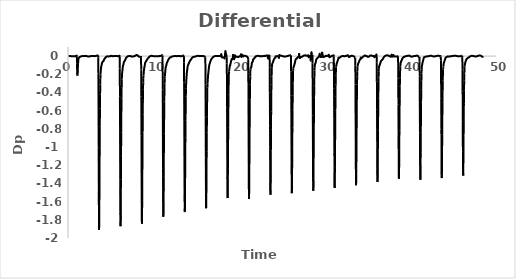
| Category | DP_Y |
|---|---|
| 0.083333 | 0.001 |
| 0.1 | 0.001 |
| 0.116667 | 0.001 |
| 0.133333 | 0.001 |
| 0.15 | 0.002 |
| 0.166667 | 0.002 |
| 0.183333 | 0.002 |
| 0.2 | 0.001 |
| 0.216667 | 0.001 |
| 0.233333 | 0.001 |
| 0.25 | 0 |
| 0.266667 | 0 |
| 0.283333 | 0 |
| 0.3 | 0 |
| 0.316667 | -0.001 |
| 0.333333 | -0.001 |
| 0.35 | -0.001 |
| 0.366667 | -0.001 |
| 0.383333 | -0.001 |
| 0.4 | -0.001 |
| 0.416667 | -0.001 |
| 0.433333 | -0.001 |
| 0.45 | -0.001 |
| 0.466667 | -0.001 |
| 0.483333 | -0.001 |
| 0.5 | -0.001 |
| 0.516667 | -0.001 |
| 0.533333 | -0.001 |
| 0.55 | -0.001 |
| 0.566667 | -0.001 |
| 0.583333 | -0.001 |
| 0.6 | -0.001 |
| 0.616667 | -0.001 |
| 0.633333 | -0.001 |
| 0.65 | -0.001 |
| 0.666667 | -0.001 |
| 0.683333 | -0.001 |
| 0.7 | -0.001 |
| 0.716667 | -0.001 |
| 0.733333 | -0.001 |
| 0.75 | -0.001 |
| 0.766667 | -0.001 |
| 0.783333 | -0.001 |
| 0.8 | -0.001 |
| 0.816667 | -0.001 |
| 0.833333 | -0.001 |
| 0.85 | -0.001 |
| 0.866667 | 0 |
| 0.883333 | 0 |
| 0.9 | 0.001 |
| 0.916667 | 0.001 |
| 0.933333 | 0.001 |
| 0.95 | 0.001 |
| 0.966667 | 0.002 |
| 0.983333 | 0.003 |
| 1.0 | 0.003 |
| 1.016667 | 0.005 |
| 1.033333 | -0.007 |
| 1.05 | -0.081 |
| 1.066667 | -0.15 |
| 1.083333 | -0.2 |
| 1.1 | -0.214 |
| 1.116667 | -0.199 |
| 1.133333 | -0.169 |
| 1.15 | -0.133 |
| 1.166667 | -0.102 |
| 1.183333 | -0.076 |
| 1.2 | -0.054 |
| 1.216667 | -0.036 |
| 1.233333 | -0.025 |
| 1.25 | -0.021 |
| 1.266667 | -0.019 |
| 1.283333 | -0.017 |
| 1.3 | -0.015 |
| 1.316667 | -0.014 |
| 1.333333 | -0.013 |
| 1.35 | -0.011 |
| 1.366667 | -0.01 |
| 1.383333 | -0.01 |
| 1.4 | -0.009 |
| 1.416667 | -0.008 |
| 1.433333 | -0.007 |
| 1.45 | -0.006 |
| 1.466667 | -0.005 |
| 1.483333 | -0.004 |
| 1.5 | -0.004 |
| 1.516667 | -0.003 |
| 1.533333 | -0.003 |
| 1.55 | -0.002 |
| 1.566667 | -0.002 |
| 1.583333 | -0.001 |
| 1.6 | -0.001 |
| 1.616667 | -0.001 |
| 1.633333 | -0.001 |
| 1.65 | 0 |
| 1.666667 | 0 |
| 1.683333 | 0 |
| 1.7 | 0 |
| 1.716667 | 0 |
| 1.733333 | 0 |
| 1.75 | 0.001 |
| 1.766667 | 0.001 |
| 1.783333 | 0.001 |
| 1.8 | 0.001 |
| 1.816667 | 0.001 |
| 1.833333 | 0.001 |
| 1.85 | 0.001 |
| 1.866667 | 0.002 |
| 1.883333 | 0.002 |
| 1.9 | 0.002 |
| 1.916667 | 0.002 |
| 1.933333 | 0.002 |
| 1.95 | 0.002 |
| 1.966667 | 0.002 |
| 1.983333 | 0.002 |
| 2.0 | 0.003 |
| 2.016667 | 0.003 |
| 2.033333 | 0.002 |
| 2.05 | 0.002 |
| 2.066667 | 0.002 |
| 2.083333 | 0.002 |
| 2.1 | 0.001 |
| 2.116667 | 0.001 |
| 2.133333 | 0.001 |
| 2.15 | 0.001 |
| 2.166667 | 0 |
| 2.183333 | 0 |
| 2.2 | 0 |
| 2.216667 | -0.001 |
| 2.233333 | -0.001 |
| 2.25 | -0.002 |
| 2.266667 | -0.002 |
| 2.283333 | -0.002 |
| 2.3 | -0.003 |
| 2.316667 | -0.004 |
| 2.333333 | -0.004 |
| 2.35 | -0.004 |
| 2.366667 | -0.004 |
| 2.383333 | -0.004 |
| 2.4 | -0.004 |
| 2.416667 | -0.004 |
| 2.433333 | -0.004 |
| 2.45 | -0.004 |
| 2.466667 | -0.004 |
| 2.483333 | -0.004 |
| 2.5 | -0.004 |
| 2.516667 | -0.003 |
| 2.533333 | -0.003 |
| 2.55 | -0.003 |
| 2.566667 | -0.003 |
| 2.583333 | -0.002 |
| 2.6 | -0.002 |
| 2.616667 | -0.001 |
| 2.633333 | -0.001 |
| 2.65 | 0 |
| 2.666667 | 0 |
| 2.683333 | 0 |
| 2.7 | 0 |
| 2.716667 | 0 |
| 2.733333 | 0 |
| 2.75 | 0.001 |
| 2.766667 | 0.001 |
| 2.783333 | 0.001 |
| 2.8 | 0.001 |
| 2.816667 | 0.002 |
| 2.833333 | 0.001 |
| 2.85 | 0.001 |
| 2.866667 | 0.001 |
| 2.883333 | 0.001 |
| 2.9 | 0 |
| 2.916667 | 0 |
| 2.933333 | 0 |
| 2.95 | 0 |
| 2.966667 | 0 |
| 2.983333 | 0 |
| 3.0 | 0 |
| 3.016667 | 0 |
| 3.033333 | 0 |
| 3.05 | -0.001 |
| 3.066667 | -0.001 |
| 3.083333 | -0.001 |
| 3.1 | 0 |
| 3.116667 | 0 |
| 3.133333 | 0 |
| 3.15 | 0.001 |
| 3.166667 | 0.001 |
| 3.183333 | 0.001 |
| 3.2 | 0.001 |
| 3.216667 | 0.002 |
| 3.233333 | 0.002 |
| 3.25 | 0.002 |
| 3.266667 | 0.002 |
| 3.283333 | 0.002 |
| 3.3 | 0.003 |
| 3.316667 | 0.004 |
| 3.333333 | 0.004 |
| 3.35 | 0.005 |
| 3.366667 | 0.005 |
| 3.383333 | 0.005 |
| 3.4 | 0.006 |
| 3.416667 | 0.007 |
| 3.433333 | 0.007 |
| 3.45 | 0.009 |
| 3.466667 | 0.01 |
| 3.483333 | 0.01 |
| 3.5 | 0.009 |
| 3.516667 | 0.01 |
| 3.533333 | -0.018 |
| 3.55 | -0.195 |
| 3.566667 | -0.538 |
| 3.583333 | -1.007 |
| 3.6 | -1.494 |
| 3.616667 | -1.818 |
| 3.633333 | -1.908 |
| 3.65 | -1.804 |
| 3.666667 | -1.574 |
| 3.683333 | -1.296 |
| 3.7 | -1.02 |
| 3.716667 | -0.776 |
| 3.733333 | -0.577 |
| 3.75 | -0.421 |
| 3.766667 | -0.313 |
| 3.783333 | -0.244 |
| 3.8 | -0.203 |
| 3.816667 | -0.176 |
| 3.833333 | -0.157 |
| 3.85 | -0.137 |
| 3.866667 | -0.127 |
| 3.883333 | -0.115 |
| 3.9 | -0.106 |
| 3.916667 | -0.104 |
| 3.933333 | -0.095 |
| 3.95 | -0.086 |
| 3.966667 | -0.082 |
| 3.983333 | -0.075 |
| 4.0 | -0.071 |
| 4.016667 | -0.069 |
| 4.033333 | -0.063 |
| 4.05 | -0.059 |
| 4.066667 | -0.06 |
| 4.083333 | -0.058 |
| 4.1 | -0.057 |
| 4.116667 | -0.056 |
| 4.133333 | -0.056 |
| 4.15 | -0.054 |
| 4.166667 | -0.051 |
| 4.183333 | -0.046 |
| 4.2 | -0.041 |
| 4.216667 | -0.038 |
| 4.233333 | -0.035 |
| 4.25 | -0.032 |
| 4.266667 | -0.03 |
| 4.283333 | -0.028 |
| 4.3 | -0.026 |
| 4.316667 | -0.023 |
| 4.333333 | -0.022 |
| 4.35 | -0.02 |
| 4.366667 | -0.018 |
| 4.383333 | -0.017 |
| 4.4 | -0.015 |
| 4.416667 | -0.013 |
| 4.433333 | -0.012 |
| 4.45 | -0.01 |
| 4.466667 | -0.009 |
| 4.483333 | -0.007 |
| 4.5 | -0.006 |
| 4.516667 | -0.004 |
| 4.533333 | -0.004 |
| 4.55 | -0.004 |
| 4.566667 | -0.003 |
| 4.583333 | -0.003 |
| 4.6 | -0.003 |
| 4.616667 | -0.003 |
| 4.633333 | -0.002 |
| 4.65 | -0.003 |
| 4.666667 | -0.003 |
| 4.683333 | -0.004 |
| 4.7 | -0.004 |
| 4.716667 | -0.005 |
| 4.733333 | -0.004 |
| 4.75 | -0.004 |
| 4.766667 | -0.004 |
| 4.783333 | -0.003 |
| 4.8 | -0.003 |
| 4.816667 | -0.003 |
| 4.833333 | -0.003 |
| 4.85 | -0.003 |
| 4.866667 | -0.002 |
| 4.883333 | -0.002 |
| 4.9 | -0.002 |
| 4.916667 | -0.002 |
| 4.933333 | -0.001 |
| 4.95 | 0 |
| 4.966667 | 0 |
| 4.983333 | 0 |
| 5.0 | 0.001 |
| 5.016667 | 0.001 |
| 5.033333 | 0.002 |
| 5.05 | 0.002 |
| 5.066667 | 0.003 |
| 5.083333 | 0.003 |
| 5.1 | 0.003 |
| 5.116667 | 0.002 |
| 5.133333 | 0.001 |
| 5.15 | 0.001 |
| 5.166667 | 0.001 |
| 5.183333 | 0.001 |
| 5.2 | 0 |
| 5.216667 | 0 |
| 5.233333 | -0.001 |
| 5.25 | -0.001 |
| 5.266667 | -0.001 |
| 5.283333 | -0.001 |
| 5.3 | -0.001 |
| 5.316667 | -0.001 |
| 5.333333 | 0 |
| 5.35 | 0 |
| 5.366667 | 0 |
| 5.383333 | 0 |
| 5.4 | 0.001 |
| 5.416667 | 0.001 |
| 5.433333 | 0.001 |
| 5.45 | 0.002 |
| 5.466667 | 0.002 |
| 5.483333 | 0.002 |
| 5.5 | 0.002 |
| 5.516667 | 0.002 |
| 5.533333 | 0.002 |
| 5.55 | 0.002 |
| 5.566667 | 0.002 |
| 5.583333 | 0.002 |
| 5.6 | 0.002 |
| 5.616667 | 0.001 |
| 5.633333 | 0.001 |
| 5.65 | 0.001 |
| 5.666667 | 0.001 |
| 5.683333 | 0.001 |
| 5.7 | 0.001 |
| 5.716667 | 0.001 |
| 5.733333 | 0.001 |
| 5.75 | 0.001 |
| 5.766667 | 0 |
| 5.783333 | 0 |
| 5.8 | -0.001 |
| 5.816667 | -0.001 |
| 5.833333 | -0.002 |
| 5.85 | -0.002 |
| 5.866667 | -0.002 |
| 5.883333 | -0.001 |
| 5.9 | -0.001 |
| 5.916667 | -0.001 |
| 5.933333 | 0 |
| 5.95 | 0.001 |
| 5.966667 | 0.001 |
| 5.983333 | 0.001 |
| 6.0 | 0.001 |
| 6.016667 | 0.004 |
| 6.033333 | -0.008 |
| 6.05 | -0.137 |
| 6.066667 | -0.441 |
| 6.083333 | -0.879 |
| 6.1 | -1.36 |
| 6.116667 | -1.721 |
| 6.133333 | -1.871 |
| 6.15 | -1.811 |
| 6.166667 | -1.614 |
| 6.183333 | -1.356 |
| 6.2 | -1.089 |
| 6.216667 | -0.842 |
| 6.233333 | -0.635 |
| 6.25 | -0.469 |
| 6.266667 | -0.343 |
| 6.283333 | -0.261 |
| 6.3 | -0.218 |
| 6.316667 | -0.193 |
| 6.333333 | -0.178 |
| 6.35 | -0.165 |
| 6.366667 | -0.149 |
| 6.383333 | -0.134 |
| 6.4 | -0.121 |
| 6.416667 | -0.11 |
| 6.433333 | -0.102 |
| 6.45 | -0.099 |
| 6.466667 | -0.095 |
| 6.483333 | -0.088 |
| 6.5 | -0.08 |
| 6.516667 | -0.07 |
| 6.533333 | -0.065 |
| 6.55 | -0.062 |
| 6.566667 | -0.061 |
| 6.583333 | -0.059 |
| 6.6 | -0.057 |
| 6.616667 | -0.054 |
| 6.633333 | -0.051 |
| 6.65 | -0.048 |
| 6.666667 | -0.045 |
| 6.683333 | -0.041 |
| 6.7 | -0.038 |
| 6.716667 | -0.034 |
| 6.733333 | -0.031 |
| 6.75 | -0.027 |
| 6.766667 | -0.024 |
| 6.783333 | -0.02 |
| 6.8 | -0.018 |
| 6.816667 | -0.016 |
| 6.833333 | -0.014 |
| 6.85 | -0.013 |
| 6.866667 | -0.012 |
| 6.883333 | -0.01 |
| 6.9 | -0.009 |
| 6.916667 | -0.008 |
| 6.933333 | -0.006 |
| 6.95 | -0.005 |
| 6.966667 | -0.004 |
| 6.983333 | -0.003 |
| 7.0 | -0.002 |
| 7.016667 | -0.002 |
| 7.033333 | -0.002 |
| 7.05 | -0.001 |
| 7.066667 | -0.001 |
| 7.083333 | 0 |
| 7.1 | 0 |
| 7.116667 | 0.001 |
| 7.133333 | 0.001 |
| 7.15 | 0.001 |
| 7.166667 | 0.001 |
| 7.183333 | 0.001 |
| 7.2 | 0.001 |
| 7.216667 | 0.001 |
| 7.233333 | 0.001 |
| 7.25 | 0 |
| 7.266667 | 0 |
| 7.283333 | 0 |
| 7.3 | -0.001 |
| 7.316667 | -0.001 |
| 7.333333 | -0.002 |
| 7.35 | -0.002 |
| 7.366667 | -0.002 |
| 7.383333 | -0.003 |
| 7.4 | -0.004 |
| 7.416667 | -0.005 |
| 7.433333 | -0.005 |
| 7.45 | -0.005 |
| 7.466667 | -0.006 |
| 7.483333 | -0.006 |
| 7.5 | -0.006 |
| 7.516667 | -0.006 |
| 7.533333 | -0.005 |
| 7.55 | -0.005 |
| 7.566667 | -0.005 |
| 7.583333 | -0.005 |
| 7.6 | -0.005 |
| 7.616667 | -0.004 |
| 7.633333 | -0.004 |
| 7.65 | -0.004 |
| 7.666667 | -0.003 |
| 7.683333 | -0.003 |
| 7.7 | -0.002 |
| 7.716667 | -0.002 |
| 7.733333 | -0.001 |
| 7.75 | 0 |
| 7.766667 | 0 |
| 7.783333 | 0.001 |
| 7.8 | 0.001 |
| 7.816667 | 0.002 |
| 7.833333 | 0.003 |
| 7.85 | 0.004 |
| 7.866667 | 0.004 |
| 7.883333 | 0.006 |
| 7.9 | 0.007 |
| 7.916667 | 0.008 |
| 7.933333 | 0.009 |
| 7.95 | 0.01 |
| 7.966667 | 0.011 |
| 7.983333 | 0.012 |
| 8.0 | 0.012 |
| 8.016667 | 0.012 |
| 8.033333 | 0.012 |
| 8.05 | 0.011 |
| 8.066667 | 0.011 |
| 8.083333 | 0.01 |
| 8.1 | 0.009 |
| 8.116667 | 0.008 |
| 8.133333 | 0.007 |
| 8.15 | 0.006 |
| 8.166667 | 0.004 |
| 8.183333 | 0.002 |
| 8.2 | 0 |
| 8.216667 | -0.001 |
| 8.233333 | -0.002 |
| 8.25 | -0.003 |
| 8.266667 | -0.004 |
| 8.283333 | -0.006 |
| 8.3 | -0.007 |
| 8.316667 | -0.008 |
| 8.333333 | -0.008 |
| 8.35 | -0.008 |
| 8.366667 | -0.008 |
| 8.383333 | -0.008 |
| 8.4 | -0.008 |
| 8.416667 | -0.008 |
| 8.433333 | -0.008 |
| 8.45 | -0.008 |
| 8.466667 | -0.007 |
| 8.483333 | -0.008 |
| 8.5 | -0.005 |
| 8.516667 | -0.001 |
| 8.533333 | -0.017 |
| 8.55 | -0.147 |
| 8.566667 | -0.447 |
| 8.583333 | -0.876 |
| 8.6 | -1.352 |
| 8.616667 | -1.705 |
| 8.633333 | -1.842 |
| 8.65 | -1.783 |
| 8.666667 | -1.591 |
| 8.683333 | -1.338 |
| 8.7 | -1.077 |
| 8.716667 | -0.844 |
| 8.733333 | -0.645 |
| 8.75 | -0.487 |
| 8.766667 | -0.366 |
| 8.783333 | -0.291 |
| 8.8 | -0.242 |
| 8.816667 | -0.213 |
| 8.833333 | -0.197 |
| 8.85 | -0.176 |
| 8.866667 | -0.161 |
| 8.883333 | -0.147 |
| 8.9 | -0.135 |
| 8.916667 | -0.127 |
| 8.933333 | -0.12 |
| 8.95 | -0.112 |
| 8.966667 | -0.105 |
| 8.983333 | -0.091 |
| 9.0 | -0.083 |
| 9.016667 | -0.073 |
| 9.033333 | -0.069 |
| 9.05 | -0.067 |
| 9.066667 | -0.065 |
| 9.083333 | -0.063 |
| 9.1 | -0.06 |
| 9.116667 | -0.057 |
| 9.133333 | -0.054 |
| 9.15 | -0.052 |
| 9.166667 | -0.049 |
| 9.183333 | -0.046 |
| 9.2 | -0.043 |
| 9.216667 | -0.041 |
| 9.233333 | -0.038 |
| 9.25 | -0.036 |
| 9.266667 | -0.034 |
| 9.283333 | -0.031 |
| 9.3 | -0.029 |
| 9.316667 | -0.027 |
| 9.333333 | -0.025 |
| 9.35 | -0.023 |
| 9.366667 | -0.022 |
| 9.383333 | -0.02 |
| 9.4 | -0.019 |
| 9.416667 | -0.017 |
| 9.433333 | -0.015 |
| 9.45 | -0.013 |
| 9.466667 | -0.012 |
| 9.483333 | -0.01 |
| 9.5 | -0.008 |
| 9.516667 | -0.007 |
| 9.533333 | -0.005 |
| 9.55 | -0.004 |
| 9.566667 | -0.003 |
| 9.583333 | -0.002 |
| 9.6 | -0.001 |
| 9.616667 | 0 |
| 9.633333 | 0 |
| 9.65 | 0.001 |
| 9.666667 | 0.002 |
| 9.683333 | 0.002 |
| 9.7 | 0.002 |
| 9.716667 | 0.003 |
| 9.733333 | 0.003 |
| 9.75 | 0.003 |
| 9.766667 | 0.003 |
| 9.783333 | 0.002 |
| 9.8 | 0.002 |
| 9.816667 | 0.002 |
| 9.833333 | 0.002 |
| 9.85 | 0.002 |
| 9.866667 | 0.001 |
| 9.883333 | 0.001 |
| 9.9 | 0 |
| 9.916667 | 0 |
| 9.933333 | 0 |
| 9.95 | 0 |
| 9.966667 | 0 |
| 9.983333 | 0 |
| 10.0 | 0 |
| 10.016667 | -0.001 |
| 10.033333 | -0.001 |
| 10.05 | -0.001 |
| 10.066667 | -0.001 |
| 10.083333 | 0 |
| 10.1 | 0 |
| 10.116667 | -0.001 |
| 10.133333 | -0.001 |
| 10.15 | -0.001 |
| 10.166667 | -0.001 |
| 10.183333 | -0.001 |
| 10.2 | -0.001 |
| 10.216667 | -0.001 |
| 10.233333 | -0.002 |
| 10.25 | -0.002 |
| 10.266667 | -0.002 |
| 10.283333 | -0.002 |
| 10.3 | -0.002 |
| 10.316667 | -0.002 |
| 10.333333 | -0.002 |
| 10.35 | -0.002 |
| 10.366667 | -0.002 |
| 10.383333 | -0.002 |
| 10.4 | -0.002 |
| 10.416667 | -0.002 |
| 10.433333 | -0.002 |
| 10.45 | -0.001 |
| 10.466667 | -0.001 |
| 10.483333 | -0.001 |
| 10.5 | -0.001 |
| 10.516667 | -0.001 |
| 10.533333 | -0.001 |
| 10.55 | -0.001 |
| 10.566667 | -0.001 |
| 10.583333 | -0.001 |
| 10.6 | 0 |
| 10.616667 | 0 |
| 10.633333 | 0 |
| 10.65 | 0 |
| 10.666667 | 0 |
| 10.683333 | -0.001 |
| 10.7 | -0.001 |
| 10.716667 | 0 |
| 10.733333 | 0 |
| 10.75 | 0 |
| 10.766667 | 0.001 |
| 10.783333 | 0.001 |
| 10.8 | 0.002 |
| 10.816667 | 0.003 |
| 10.833333 | 0.003 |
| 10.85 | 0.003 |
| 10.866667 | 0.004 |
| 10.883333 | 0.005 |
| 10.9 | 0.006 |
| 10.916667 | 0.006 |
| 10.933333 | 0.008 |
| 10.95 | 0.009 |
| 10.966667 | 0.01 |
| 10.983333 | 0.01 |
| 11.0 | 0.009 |
| 11.016667 | 0.009 |
| 11.033333 | 0.004 |
| 11.05 | -0.1 |
| 11.066667 | -0.368 |
| 11.083333 | -0.768 |
| 11.1 | -1.233 |
| 11.116667 | -1.603 |
| 11.133333 | -1.767 |
| 11.15 | -1.733 |
| 11.166667 | -1.557 |
| 11.183333 | -1.322 |
| 11.2 | -1.078 |
| 11.216667 | -0.852 |
| 11.233333 | -0.659 |
| 11.25 | -0.5 |
| 11.266667 | -0.383 |
| 11.283333 | -0.303 |
| 11.3 | -0.25 |
| 11.316667 | -0.222 |
| 11.333333 | -0.198 |
| 11.35 | -0.182 |
| 11.366667 | -0.164 |
| 11.383333 | -0.147 |
| 11.4 | -0.133 |
| 11.416667 | -0.124 |
| 11.433333 | -0.115 |
| 11.45 | -0.112 |
| 11.466667 | -0.107 |
| 11.483333 | -0.101 |
| 11.5 | -0.095 |
| 11.516667 | -0.084 |
| 11.533333 | -0.078 |
| 11.55 | -0.075 |
| 11.566667 | -0.07 |
| 11.583333 | -0.069 |
| 11.6 | -0.068 |
| 11.616667 | -0.062 |
| 11.633333 | -0.058 |
| 11.65 | -0.054 |
| 11.666667 | -0.05 |
| 11.683333 | -0.047 |
| 11.7 | -0.044 |
| 11.716667 | -0.041 |
| 11.733333 | -0.038 |
| 11.75 | -0.035 |
| 11.766667 | -0.032 |
| 11.783333 | -0.03 |
| 11.8 | -0.028 |
| 11.816667 | -0.026 |
| 11.833333 | -0.024 |
| 11.85 | -0.022 |
| 11.866667 | -0.02 |
| 11.883333 | -0.019 |
| 11.9 | -0.017 |
| 11.916667 | -0.016 |
| 11.933333 | -0.015 |
| 11.95 | -0.015 |
| 11.966667 | -0.014 |
| 11.983333 | -0.013 |
| 12.0 | -0.012 |
| 12.016667 | -0.011 |
| 12.033333 | -0.01 |
| 12.05 | -0.009 |
| 12.066667 | -0.008 |
| 12.083333 | -0.008 |
| 12.1 | -0.007 |
| 12.116667 | -0.006 |
| 12.133333 | -0.006 |
| 12.15 | -0.005 |
| 12.166667 | -0.005 |
| 12.183333 | -0.004 |
| 12.2 | -0.004 |
| 12.216667 | -0.003 |
| 12.233333 | -0.003 |
| 12.25 | -0.002 |
| 12.266667 | -0.002 |
| 12.283333 | -0.002 |
| 12.3 | -0.001 |
| 12.316667 | -0.001 |
| 12.333333 | -0.001 |
| 12.35 | -0.001 |
| 12.366667 | -0.001 |
| 12.383333 | -0.001 |
| 12.4 | 0 |
| 12.416667 | 0 |
| 12.433333 | 0 |
| 12.45 | 0 |
| 12.466667 | 0 |
| 12.483333 | 0 |
| 12.5 | 0 |
| 12.516667 | 0 |
| 12.533333 | 0 |
| 12.55 | 0 |
| 12.566667 | 0 |
| 12.583333 | 0 |
| 12.6 | 0 |
| 12.616667 | 0 |
| 12.633333 | 0 |
| 12.65 | 0 |
| 12.666667 | 0 |
| 12.683333 | 0 |
| 12.7 | 0 |
| 12.716667 | -0.001 |
| 12.733333 | -0.001 |
| 12.75 | -0.001 |
| 12.766667 | 0 |
| 12.783333 | 0 |
| 12.8 | 0.001 |
| 12.816667 | 0.001 |
| 12.833333 | 0.001 |
| 12.85 | 0.002 |
| 12.866667 | 0.002 |
| 12.883333 | 0.002 |
| 12.9 | 0.002 |
| 12.916667 | 0.002 |
| 12.933333 | 0.002 |
| 12.95 | 0.002 |
| 12.966667 | 0.002 |
| 12.983333 | 0.002 |
| 13.0 | 0.002 |
| 13.016667 | 0.002 |
| 13.033333 | 0.002 |
| 13.05 | 0.001 |
| 13.066667 | 0.001 |
| 13.083333 | 0.001 |
| 13.1 | 0 |
| 13.116667 | 0 |
| 13.133333 | -0.001 |
| 13.15 | -0.001 |
| 13.166667 | -0.001 |
| 13.183333 | -0.002 |
| 13.2 | -0.002 |
| 13.216667 | -0.002 |
| 13.233333 | -0.002 |
| 13.25 | -0.001 |
| 13.266667 | -0.001 |
| 13.283333 | 0 |
| 13.3 | 0 |
| 13.316667 | 0 |
| 13.333333 | 0.001 |
| 13.35 | 0.001 |
| 13.366667 | 0.001 |
| 13.383333 | 0.002 |
| 13.4 | 0.003 |
| 13.416667 | 0.004 |
| 13.433333 | 0.005 |
| 13.45 | 0.005 |
| 13.466667 | 0.006 |
| 13.483333 | 0.006 |
| 13.5 | 0.006 |
| 13.516667 | 0.005 |
| 13.533333 | 0.005 |
| 13.55 | -0.067 |
| 13.566667 | -0.292 |
| 13.583333 | -0.659 |
| 13.6 | -1.111 |
| 13.616667 | -1.507 |
| 13.633333 | -1.71 |
| 13.65 | -1.712 |
| 13.666667 | -1.562 |
| 13.683333 | -1.344 |
| 13.7 | -1.109 |
| 13.716667 | -0.895 |
| 13.733333 | -0.712 |
| 13.75 | -0.56 |
| 13.766667 | -0.441 |
| 13.783333 | -0.358 |
| 13.8 | -0.306 |
| 13.816667 | -0.274 |
| 13.833333 | -0.249 |
| 13.85 | -0.229 |
| 13.866667 | -0.204 |
| 13.883333 | -0.186 |
| 13.9 | -0.175 |
| 13.916667 | -0.16 |
| 13.933333 | -0.146 |
| 13.95 | -0.134 |
| 13.966667 | -0.121 |
| 13.983333 | -0.11 |
| 14.0 | -0.106 |
| 14.016667 | -0.097 |
| 14.033333 | -0.096 |
| 14.05 | -0.095 |
| 14.066667 | -0.088 |
| 14.083333 | -0.087 |
| 14.1 | -0.085 |
| 14.116667 | -0.079 |
| 14.133333 | -0.075 |
| 14.15 | -0.071 |
| 14.166667 | -0.067 |
| 14.183333 | -0.063 |
| 14.2 | -0.06 |
| 14.216667 | -0.057 |
| 14.233333 | -0.054 |
| 14.25 | -0.052 |
| 14.266667 | -0.05 |
| 14.283333 | -0.049 |
| 14.3 | -0.046 |
| 14.316667 | -0.044 |
| 14.333333 | -0.041 |
| 14.35 | -0.039 |
| 14.366667 | -0.037 |
| 14.383333 | -0.035 |
| 14.4 | -0.033 |
| 14.416667 | -0.03 |
| 14.433333 | -0.028 |
| 14.45 | -0.025 |
| 14.466667 | -0.023 |
| 14.483333 | -0.02 |
| 14.5 | -0.019 |
| 14.516667 | -0.017 |
| 14.533333 | -0.016 |
| 14.55 | -0.014 |
| 14.566667 | -0.013 |
| 14.583333 | -0.012 |
| 14.6 | -0.011 |
| 14.616667 | -0.01 |
| 14.633333 | -0.009 |
| 14.65 | -0.009 |
| 14.666667 | -0.008 |
| 14.683333 | -0.008 |
| 14.7 | -0.007 |
| 14.716667 | -0.007 |
| 14.733333 | -0.007 |
| 14.75 | -0.006 |
| 14.766667 | -0.006 |
| 14.783333 | -0.006 |
| 14.8 | -0.006 |
| 14.816667 | -0.007 |
| 14.833333 | -0.006 |
| 14.85 | -0.006 |
| 14.866667 | -0.005 |
| 14.883333 | -0.004 |
| 14.9 | -0.004 |
| 14.916667 | -0.003 |
| 14.933333 | -0.002 |
| 14.95 | -0.002 |
| 14.966667 | -0.001 |
| 14.983333 | 0 |
| 15.0 | 0 |
| 15.016667 | 0 |
| 15.033333 | 0 |
| 15.05 | 0.001 |
| 15.066667 | 0.002 |
| 15.083333 | 0.002 |
| 15.1 | 0.002 |
| 15.116667 | 0.002 |
| 15.133333 | 0.003 |
| 15.15 | 0.003 |
| 15.166667 | 0.004 |
| 15.183333 | 0.003 |
| 15.2 | 0.003 |
| 15.216667 | 0.003 |
| 15.233333 | 0.003 |
| 15.25 | 0.002 |
| 15.266667 | 0.002 |
| 15.283333 | 0.002 |
| 15.3 | 0.002 |
| 15.316667 | 0.002 |
| 15.333333 | 0.002 |
| 15.35 | 0.002 |
| 15.366667 | 0.002 |
| 15.383333 | 0.002 |
| 15.4 | 0.002 |
| 15.416667 | 0.002 |
| 15.433333 | 0.002 |
| 15.45 | 0.002 |
| 15.466667 | 0.002 |
| 15.483333 | 0.002 |
| 15.5 | 0.002 |
| 15.516667 | 0.002 |
| 15.533333 | 0.002 |
| 15.55 | 0.002 |
| 15.566667 | 0.002 |
| 15.583333 | 0.002 |
| 15.6 | 0.002 |
| 15.616667 | 0.002 |
| 15.633333 | 0.001 |
| 15.65 | 0.001 |
| 15.666667 | 0 |
| 15.683333 | 0 |
| 15.7 | 0 |
| 15.716667 | 0 |
| 15.733333 | 0 |
| 15.75 | 0.001 |
| 15.766667 | 0 |
| 15.783333 | 0 |
| 15.8 | 0 |
| 15.816667 | -0.001 |
| 15.833333 | -0.001 |
| 15.85 | -0.002 |
| 15.866667 | -0.002 |
| 15.883333 | -0.002 |
| 15.9 | -0.002 |
| 15.916667 | -0.002 |
| 15.933333 | -0.002 |
| 15.95 | -0.004 |
| 15.966667 | -0.006 |
| 15.983333 | -0.008 |
| 16.0 | -0.009 |
| 16.016667 | -0.01 |
| 16.033333 | -0.011 |
| 16.05 | -0.086 |
| 16.066667 | -0.311 |
| 16.083333 | -0.673 |
| 16.1 | -1.113 |
| 16.116667 | -1.493 |
| 16.133333 | -1.673 |
| 16.15 | -1.658 |
| 16.166667 | -1.5 |
| 16.183333 | -1.281 |
| 16.2 | -1.049 |
| 16.216667 | -0.84 |
| 16.233333 | -0.667 |
| 16.25 | -0.526 |
| 16.266667 | -0.418 |
| 16.283333 | -0.343 |
| 16.3 | -0.305 |
| 16.316667 | -0.277 |
| 16.333333 | -0.254 |
| 16.35 | -0.232 |
| 16.366667 | -0.21 |
| 16.383333 | -0.193 |
| 16.4 | -0.18 |
| 16.416667 | -0.163 |
| 16.433333 | -0.153 |
| 16.45 | -0.137 |
| 16.466667 | -0.122 |
| 16.483333 | -0.11 |
| 16.5 | -0.103 |
| 16.516667 | -0.094 |
| 16.533333 | -0.09 |
| 16.55 | -0.082 |
| 16.566667 | -0.081 |
| 16.583333 | -0.075 |
| 16.6 | -0.07 |
| 16.616667 | -0.065 |
| 16.633333 | -0.061 |
| 16.65 | -0.056 |
| 16.666667 | -0.051 |
| 16.683333 | -0.047 |
| 16.7 | -0.043 |
| 16.716667 | -0.04 |
| 16.733333 | -0.037 |
| 16.75 | -0.034 |
| 16.766667 | -0.031 |
| 16.783333 | -0.029 |
| 16.8 | -0.026 |
| 16.816667 | -0.024 |
| 16.833333 | -0.022 |
| 16.85 | -0.021 |
| 16.866667 | -0.019 |
| 16.883333 | -0.017 |
| 16.9 | -0.016 |
| 16.916667 | -0.014 |
| 16.933333 | -0.012 |
| 16.95 | -0.011 |
| 16.966667 | -0.01 |
| 16.983333 | -0.008 |
| 17.0 | -0.007 |
| 17.016667 | -0.006 |
| 17.033333 | -0.005 |
| 17.05 | -0.005 |
| 17.066667 | -0.004 |
| 17.083333 | -0.003 |
| 17.1 | -0.002 |
| 17.116667 | -0.002 |
| 17.133333 | -0.001 |
| 17.15 | -0.001 |
| 17.166667 | 0 |
| 17.183333 | 0 |
| 17.2 | 0 |
| 17.216667 | 0 |
| 17.233333 | 0 |
| 17.25 | 0 |
| 17.266667 | 0 |
| 17.283333 | 0 |
| 17.3 | 0 |
| 17.316667 | 0 |
| 17.333333 | 0 |
| 17.35 | 0 |
| 17.366667 | 0.001 |
| 17.383333 | 0 |
| 17.4 | 0 |
| 17.416667 | 0 |
| 17.433333 | 0 |
| 17.45 | 0 |
| 17.466667 | 0 |
| 17.483333 | 0 |
| 17.5 | 0 |
| 17.516667 | 0 |
| 17.533333 | 0 |
| 17.55 | 0.001 |
| 17.566667 | 0.001 |
| 17.583333 | 0.001 |
| 17.6 | 0.002 |
| 17.616667 | 0.001 |
| 17.633333 | 0.001 |
| 17.65 | 0.001 |
| 17.666667 | 0.001 |
| 17.683333 | 0.001 |
| 17.7 | 0.001 |
| 17.716667 | 0.001 |
| 17.733333 | 0.001 |
| 17.75 | 0.001 |
| 17.766667 | 0.001 |
| 17.783333 | 0.001 |
| 17.8 | 0 |
| 17.816667 | -0.001 |
| 17.833333 | 0 |
| 17.85 | 0.003 |
| 17.866667 | 0.009 |
| 17.883333 | 0.017 |
| 17.9 | 0.021 |
| 17.916667 | 0.021 |
| 17.933333 | 0.011 |
| 17.95 | 0.001 |
| 17.966667 | -0.007 |
| 17.983333 | -0.013 |
| 18.0 | -0.015 |
| 18.016667 | -0.015 |
| 18.033333 | -0.014 |
| 18.05 | -0.013 |
| 18.066667 | -0.013 |
| 18.083333 | -0.013 |
| 18.1 | -0.013 |
| 18.116667 | -0.014 |
| 18.133333 | -0.014 |
| 18.15 | -0.015 |
| 18.166667 | -0.015 |
| 18.183333 | -0.015 |
| 18.2 | -0.015 |
| 18.216667 | -0.017 |
| 18.233333 | -0.018 |
| 18.25 | -0.02 |
| 18.266667 | -0.022 |
| 18.283333 | -0.024 |
| 18.3 | -0.027 |
| 18.316667 | -0.023 |
| 18.333333 | 0.001 |
| 18.35 | 0.024 |
| 18.366667 | 0.044 |
| 18.383333 | 0.054 |
| 18.4 | 0.055 |
| 18.416667 | 0.047 |
| 18.433333 | 0.035 |
| 18.45 | 0.023 |
| 18.466667 | 0.017 |
| 18.483333 | 0.014 |
| 18.5 | 0.011 |
| 18.516667 | -0.002 |
| 18.533333 | -0.013 |
| 18.55 | -0.08 |
| 18.566667 | -0.263 |
| 18.583333 | -0.563 |
| 18.6 | -0.956 |
| 18.616667 | -1.321 |
| 18.633333 | -1.539 |
| 18.65 | -1.561 |
| 18.666667 | -1.442 |
| 18.683333 | -1.233 |
| 18.7 | -1.007 |
| 18.716667 | -0.787 |
| 18.733333 | -0.591 |
| 18.75 | -0.425 |
| 18.766667 | -0.307 |
| 18.783333 | -0.229 |
| 18.8 | -0.187 |
| 18.816667 | -0.168 |
| 18.833333 | -0.154 |
| 18.85 | -0.141 |
| 18.866667 | -0.132 |
| 18.883333 | -0.123 |
| 18.9 | -0.109 |
| 18.916667 | -0.1 |
| 18.933333 | -0.096 |
| 18.95 | -0.101 |
| 18.966667 | -0.094 |
| 18.983333 | -0.083 |
| 19.0 | -0.079 |
| 19.016667 | -0.076 |
| 19.033333 | -0.064 |
| 19.05 | -0.055 |
| 19.066667 | -0.048 |
| 19.083333 | -0.044 |
| 19.1 | -0.04 |
| 19.116667 | -0.037 |
| 19.133333 | -0.032 |
| 19.15 | -0.03 |
| 19.166667 | -0.03 |
| 19.183333 | -0.029 |
| 19.2 | -0.033 |
| 19.216667 | -0.034 |
| 19.233333 | -0.029 |
| 19.25 | -0.023 |
| 19.266667 | -0.018 |
| 19.283333 | -0.005 |
| 19.3 | 0.023 |
| 19.316667 | 0.013 |
| 19.333333 | 0.006 |
| 19.35 | -0.006 |
| 19.366667 | -0.015 |
| 19.383333 | -0.022 |
| 19.4 | -0.034 |
| 19.416667 | -0.035 |
| 19.433333 | -0.029 |
| 19.45 | -0.023 |
| 19.466667 | -0.018 |
| 19.483333 | -0.014 |
| 19.5 | -0.008 |
| 19.516667 | 0.006 |
| 19.533333 | 0.007 |
| 19.55 | 0.003 |
| 19.566667 | -0.003 |
| 19.583333 | -0.007 |
| 19.6 | -0.007 |
| 19.616667 | -0.008 |
| 19.633333 | -0.008 |
| 19.65 | -0.008 |
| 19.666667 | -0.008 |
| 19.683333 | -0.007 |
| 19.7 | -0.006 |
| 19.716667 | -0.007 |
| 19.733333 | -0.007 |
| 19.75 | -0.007 |
| 19.766667 | -0.007 |
| 19.783333 | -0.007 |
| 19.8 | -0.008 |
| 19.816667 | -0.009 |
| 19.833333 | -0.009 |
| 19.85 | -0.009 |
| 19.866667 | -0.009 |
| 19.883333 | -0.009 |
| 19.9 | -0.01 |
| 19.916667 | -0.01 |
| 19.933333 | -0.009 |
| 19.95 | -0.008 |
| 19.966667 | -0.006 |
| 19.983333 | -0.005 |
| 20.0 | -0.005 |
| 20.016667 | -0.004 |
| 20.033333 | -0.004 |
| 20.05 | -0.002 |
| 20.066667 | -0.001 |
| 20.083333 | -0.001 |
| 20.1 | 0 |
| 20.116667 | 0.002 |
| 20.133333 | 0.005 |
| 20.15 | 0.007 |
| 20.166667 | 0.01 |
| 20.183333 | 0.013 |
| 20.2 | 0.018 |
| 20.216667 | 0.021 |
| 20.233333 | 0.007 |
| 20.25 | -0.006 |
| 20.266667 | -0.009 |
| 20.283333 | -0.008 |
| 20.3 | -0.007 |
| 20.316667 | -0.001 |
| 20.333333 | 0.013 |
| 20.35 | 0.016 |
| 20.366667 | 0.013 |
| 20.383333 | 0.008 |
| 20.4 | 0.004 |
| 20.416667 | 0 |
| 20.433333 | -0.003 |
| 20.45 | -0.004 |
| 20.466667 | -0.005 |
| 20.483333 | -0.003 |
| 20.5 | -0.001 |
| 20.516667 | 0 |
| 20.533333 | 0.001 |
| 20.55 | 0.002 |
| 20.566667 | 0.003 |
| 20.583333 | 0.004 |
| 20.6 | 0.004 |
| 20.616667 | 0.004 |
| 20.633333 | 0.004 |
| 20.65 | 0.004 |
| 20.666667 | 0.004 |
| 20.683333 | 0.004 |
| 20.7 | 0.003 |
| 20.716667 | 0.003 |
| 20.733333 | 0.002 |
| 20.75 | 0.001 |
| 20.766667 | 0 |
| 20.783333 | -0.001 |
| 20.8 | -0.002 |
| 20.816667 | -0.002 |
| 20.833333 | -0.002 |
| 20.85 | -0.003 |
| 20.866667 | -0.004 |
| 20.883333 | -0.005 |
| 20.9 | -0.007 |
| 20.916667 | -0.008 |
| 20.933333 | -0.008 |
| 20.95 | -0.007 |
| 20.966667 | -0.007 |
| 20.983333 | -0.007 |
| 21.0 | -0.01 |
| 21.016667 | -0.011 |
| 21.033333 | -0.012 |
| 21.05 | -0.04 |
| 21.066667 | -0.194 |
| 21.083333 | -0.481 |
| 21.1 | -0.867 |
| 21.116667 | -1.254 |
| 21.133333 | -1.504 |
| 21.15 | -1.572 |
| 21.166667 | -1.473 |
| 21.183333 | -1.269 |
| 21.2 | -1.031 |
| 21.216667 | -0.801 |
| 21.233333 | -0.603 |
| 21.25 | -0.439 |
| 21.266667 | -0.312 |
| 21.283333 | -0.225 |
| 21.3 | -0.174 |
| 21.316667 | -0.143 |
| 21.333333 | -0.134 |
| 21.35 | -0.131 |
| 21.366667 | -0.127 |
| 21.383333 | -0.129 |
| 21.4 | -0.121 |
| 21.416667 | -0.12 |
| 21.433333 | -0.109 |
| 21.45 | -0.099 |
| 21.466667 | -0.087 |
| 21.483333 | -0.075 |
| 21.5 | -0.07 |
| 21.516667 | -0.07 |
| 21.533333 | -0.068 |
| 21.55 | -0.066 |
| 21.566667 | -0.064 |
| 21.583333 | -0.06 |
| 21.6 | -0.051 |
| 21.616667 | -0.042 |
| 21.633333 | -0.036 |
| 21.65 | -0.036 |
| 21.666667 | -0.035 |
| 21.683333 | -0.032 |
| 21.7 | -0.03 |
| 21.716667 | -0.027 |
| 21.733333 | -0.026 |
| 21.75 | -0.026 |
| 21.766667 | -0.024 |
| 21.783333 | -0.022 |
| 21.8 | -0.019 |
| 21.816667 | -0.018 |
| 21.833333 | -0.016 |
| 21.85 | -0.016 |
| 21.866667 | -0.014 |
| 21.883333 | -0.009 |
| 21.9 | -0.006 |
| 21.916667 | -0.005 |
| 21.933333 | -0.003 |
| 21.95 | -0.002 |
| 21.966667 | -0.002 |
| 21.983333 | -0.001 |
| 22.0 | -0.001 |
| 22.016667 | 0 |
| 22.033333 | 0 |
| 22.05 | 0.001 |
| 22.066667 | 0.001 |
| 22.083333 | 0.001 |
| 22.1 | 0.002 |
| 22.116667 | 0.002 |
| 22.133333 | 0.003 |
| 22.15 | 0.003 |
| 22.166667 | 0.003 |
| 22.183333 | 0.003 |
| 22.2 | 0.002 |
| 22.216667 | 0.002 |
| 22.233333 | 0.002 |
| 22.25 | 0.002 |
| 22.266667 | 0.002 |
| 22.283333 | 0.002 |
| 22.3 | 0.002 |
| 22.316667 | 0.001 |
| 22.333333 | 0.001 |
| 22.35 | 0.001 |
| 22.366667 | 0 |
| 22.383333 | -0.001 |
| 22.4 | -0.002 |
| 22.416667 | -0.003 |
| 22.433333 | -0.004 |
| 22.45 | -0.004 |
| 22.466667 | -0.003 |
| 22.483333 | -0.003 |
| 22.5 | -0.002 |
| 22.516667 | -0.001 |
| 22.533333 | -0.001 |
| 22.55 | 0 |
| 22.566667 | 0 |
| 22.583333 | 0 |
| 22.6 | 0 |
| 22.616667 | 0 |
| 22.633333 | -0.001 |
| 22.65 | -0.001 |
| 22.666667 | -0.001 |
| 22.683333 | 0 |
| 22.7 | 0 |
| 22.716667 | 0 |
| 22.733333 | -0.001 |
| 22.75 | -0.001 |
| 22.766667 | -0.001 |
| 22.783333 | 0 |
| 22.8 | 0 |
| 22.816667 | 0 |
| 22.833333 | 0 |
| 22.85 | 0.001 |
| 22.866667 | 0.001 |
| 22.883333 | 0.002 |
| 22.9 | 0.002 |
| 22.916667 | 0.002 |
| 22.933333 | 0.002 |
| 22.95 | 0.002 |
| 22.966667 | 0.002 |
| 22.983333 | 0.003 |
| 23.0 | 0.003 |
| 23.016667 | 0.002 |
| 23.033333 | 0.002 |
| 23.05 | 0.002 |
| 23.066667 | 0.003 |
| 23.083333 | 0.004 |
| 23.1 | 0.002 |
| 23.116667 | 0.002 |
| 23.133333 | 0.004 |
| 23.15 | 0.006 |
| 23.166667 | 0.006 |
| 23.183333 | 0.005 |
| 23.2 | 0.005 |
| 23.216667 | 0.006 |
| 23.233333 | 0.007 |
| 23.25 | 0.006 |
| 23.266667 | 0.005 |
| 23.283333 | 0.005 |
| 23.3 | 0.006 |
| 23.316667 | 0.004 |
| 23.333333 | -0.011 |
| 23.35 | -0.017 |
| 23.366667 | -0.022 |
| 23.383333 | -0.026 |
| 23.4 | -0.027 |
| 23.416667 | -0.015 |
| 23.433333 | 0 |
| 23.45 | 0.006 |
| 23.466667 | 0.006 |
| 23.483333 | 0.004 |
| 23.5 | 0.002 |
| 23.516667 | 0 |
| 23.533333 | 0.004 |
| 23.55 | -0.008 |
| 23.566667 | -0.129 |
| 23.583333 | -0.403 |
| 23.6 | -0.763 |
| 23.616667 | -1.152 |
| 23.633333 | -1.426 |
| 23.65 | -1.525 |
| 23.666667 | -1.453 |
| 23.683333 | -1.271 |
| 23.7 | -1.039 |
| 23.716667 | -0.804 |
| 23.733333 | -0.607 |
| 23.75 | -0.439 |
| 23.766667 | -0.31 |
| 23.783333 | -0.225 |
| 23.8 | -0.164 |
| 23.816667 | -0.124 |
| 23.833333 | -0.101 |
| 23.85 | -0.089 |
| 23.866667 | -0.082 |
| 23.883333 | -0.079 |
| 23.9 | -0.076 |
| 23.916667 | -0.073 |
| 23.933333 | -0.069 |
| 23.95 | -0.065 |
| 23.966667 | -0.062 |
| 23.983333 | -0.057 |
| 24.0 | -0.051 |
| 24.016667 | -0.046 |
| 24.033333 | -0.041 |
| 24.05 | -0.036 |
| 24.066667 | -0.033 |
| 24.083333 | -0.031 |
| 24.1 | -0.029 |
| 24.116667 | -0.028 |
| 24.133333 | -0.025 |
| 24.15 | -0.023 |
| 24.166667 | -0.021 |
| 24.183333 | -0.02 |
| 24.2 | -0.02 |
| 24.216667 | -0.018 |
| 24.233333 | -0.012 |
| 24.25 | -0.005 |
| 24.266667 | -0.002 |
| 24.283333 | -0.002 |
| 24.3 | -0.003 |
| 24.316667 | -0.003 |
| 24.333333 | -0.004 |
| 24.35 | -0.004 |
| 24.366667 | -0.003 |
| 24.383333 | -0.003 |
| 24.4 | -0.002 |
| 24.416667 | -0.002 |
| 24.433333 | -0.002 |
| 24.45 | -0.002 |
| 24.466667 | -0.002 |
| 24.483333 | -0.002 |
| 24.5 | -0.001 |
| 24.516667 | 0 |
| 24.533333 | 0.001 |
| 24.55 | 0.001 |
| 24.566667 | 0.002 |
| 24.583333 | 0.003 |
| 24.6 | -0.003 |
| 24.616667 | -0.017 |
| 24.633333 | -0.02 |
| 24.65 | -0.02 |
| 24.666667 | -0.005 |
| 24.683333 | 0.007 |
| 24.7 | 0.012 |
| 24.716667 | 0.011 |
| 24.733333 | 0.01 |
| 24.75 | 0.009 |
| 24.766667 | 0.008 |
| 24.783333 | 0.008 |
| 24.8 | 0.007 |
| 24.816667 | 0.006 |
| 24.833333 | 0.006 |
| 24.85 | 0.006 |
| 24.866667 | 0.005 |
| 24.883333 | 0.005 |
| 24.9 | 0.004 |
| 24.916667 | 0.003 |
| 24.933333 | 0.003 |
| 24.95 | 0.002 |
| 24.966667 | 0.002 |
| 24.983333 | 0.002 |
| 25.0 | 0.001 |
| 25.016667 | 0.001 |
| 25.033333 | 0 |
| 25.05 | 0 |
| 25.066667 | 0 |
| 25.083333 | -0.001 |
| 25.1 | -0.001 |
| 25.116667 | -0.002 |
| 25.133333 | -0.003 |
| 25.15 | -0.003 |
| 25.166667 | -0.004 |
| 25.183333 | -0.004 |
| 25.2 | -0.005 |
| 25.216667 | -0.005 |
| 25.233333 | -0.005 |
| 25.25 | -0.005 |
| 25.266667 | -0.005 |
| 25.283333 | -0.006 |
| 25.3 | -0.005 |
| 25.316667 | -0.005 |
| 25.333333 | -0.005 |
| 25.35 | -0.006 |
| 25.366667 | -0.005 |
| 25.383333 | -0.005 |
| 25.4 | -0.005 |
| 25.416667 | -0.005 |
| 25.433333 | -0.005 |
| 25.45 | -0.004 |
| 25.466667 | -0.003 |
| 25.483333 | -0.003 |
| 25.5 | -0.002 |
| 25.516667 | -0.002 |
| 25.533333 | -0.002 |
| 25.55 | -0.001 |
| 25.566667 | -0.001 |
| 25.583333 | -0.001 |
| 25.6 | 0 |
| 25.616667 | 0 |
| 25.633333 | 0.001 |
| 25.65 | 0.001 |
| 25.666667 | 0.002 |
| 25.683333 | 0.002 |
| 25.7 | 0.002 |
| 25.716667 | 0.003 |
| 25.733333 | 0.003 |
| 25.75 | 0.004 |
| 25.766667 | 0.005 |
| 25.783333 | 0.006 |
| 25.8 | 0.006 |
| 25.816667 | 0.006 |
| 25.833333 | 0.006 |
| 25.85 | 0.006 |
| 25.866667 | 0.006 |
| 25.883333 | 0.005 |
| 25.9 | 0.006 |
| 25.916667 | 0.006 |
| 25.933333 | 0.007 |
| 25.95 | 0.006 |
| 25.966667 | 0.006 |
| 25.983333 | 0.008 |
| 26.0 | 0.01 |
| 26.016667 | 0.01 |
| 26.033333 | 0.01 |
| 26.05 | -0.02 |
| 26.066667 | -0.166 |
| 26.083333 | -0.435 |
| 26.1 | -0.803 |
| 26.116667 | -1.181 |
| 26.133333 | -1.431 |
| 26.15 | -1.507 |
| 26.166667 | -1.415 |
| 26.183333 | -1.229 |
| 26.2 | -1.007 |
| 26.216667 | -0.786 |
| 26.233333 | -0.591 |
| 26.25 | -0.431 |
| 26.266667 | -0.299 |
| 26.283333 | -0.208 |
| 26.3 | -0.161 |
| 26.316667 | -0.139 |
| 26.333333 | -0.126 |
| 26.35 | -0.121 |
| 26.366667 | -0.118 |
| 26.383333 | -0.111 |
| 26.4 | -0.107 |
| 26.416667 | -0.104 |
| 26.433333 | -0.102 |
| 26.45 | -0.091 |
| 26.466667 | -0.082 |
| 26.483333 | -0.079 |
| 26.5 | -0.076 |
| 26.516667 | -0.074 |
| 26.533333 | -0.062 |
| 26.55 | -0.054 |
| 26.566667 | -0.045 |
| 26.583333 | -0.042 |
| 26.6 | -0.038 |
| 26.616667 | -0.035 |
| 26.633333 | -0.033 |
| 26.65 | -0.031 |
| 26.666667 | -0.029 |
| 26.683333 | -0.029 |
| 26.7 | -0.027 |
| 26.716667 | -0.025 |
| 26.733333 | -0.023 |
| 26.75 | -0.022 |
| 26.766667 | -0.021 |
| 26.783333 | -0.02 |
| 26.8 | -0.019 |
| 26.816667 | -0.016 |
| 26.833333 | -0.014 |
| 26.85 | -0.013 |
| 26.866667 | -0.012 |
| 26.883333 | -0.009 |
| 26.9 | -0.008 |
| 26.916667 | -0.009 |
| 26.933333 | -0.009 |
| 26.95 | -0.009 |
| 26.966667 | -0.01 |
| 26.983333 | -0.003 |
| 27.0 | 0.032 |
| 27.016667 | 0.018 |
| 27.033333 | 0.001 |
| 27.05 | -0.01 |
| 27.066667 | -0.019 |
| 27.083333 | -0.022 |
| 27.1 | -0.021 |
| 27.116667 | -0.018 |
| 27.133333 | -0.016 |
| 27.15 | -0.014 |
| 27.166667 | -0.012 |
| 27.183333 | -0.011 |
| 27.2 | -0.01 |
| 27.216667 | -0.01 |
| 27.233333 | -0.01 |
| 27.25 | -0.01 |
| 27.266667 | -0.009 |
| 27.283333 | -0.008 |
| 27.3 | -0.008 |
| 27.316667 | -0.008 |
| 27.333333 | -0.008 |
| 27.35 | -0.007 |
| 27.366667 | -0.006 |
| 27.383333 | -0.005 |
| 27.4 | -0.004 |
| 27.416667 | -0.003 |
| 27.433333 | -0.002 |
| 27.45 | 0 |
| 27.466667 | 0.002 |
| 27.483333 | 0.003 |
| 27.5 | 0.004 |
| 27.516667 | 0.004 |
| 27.533333 | 0.004 |
| 27.55 | 0.005 |
| 27.566667 | 0.006 |
| 27.583333 | 0.007 |
| 27.6 | 0.008 |
| 27.616667 | 0.008 |
| 27.633333 | 0.007 |
| 27.65 | 0.007 |
| 27.666667 | 0.007 |
| 27.683333 | 0.007 |
| 27.7 | 0.008 |
| 27.716667 | 0.008 |
| 27.733333 | 0.008 |
| 27.75 | 0.008 |
| 27.766667 | 0.009 |
| 27.783333 | 0.008 |
| 27.8 | 0.007 |
| 27.816667 | 0.006 |
| 27.833333 | 0.006 |
| 27.85 | 0.005 |
| 27.866667 | 0.005 |
| 27.883333 | 0.005 |
| 27.9 | 0.005 |
| 27.916667 | 0.005 |
| 27.933333 | 0.004 |
| 27.95 | 0.004 |
| 27.966667 | 0.004 |
| 27.983333 | 0.003 |
| 28.0 | 0.003 |
| 28.016667 | 0.004 |
| 28.033333 | 0.004 |
| 28.05 | 0.005 |
| 28.066667 | 0.009 |
| 28.083333 | 0.002 |
| 28.1 | -0.01 |
| 28.116667 | -0.012 |
| 28.133333 | -0.008 |
| 28.15 | -0.006 |
| 28.166667 | -0.007 |
| 28.183333 | -0.006 |
| 28.2 | -0.004 |
| 28.216667 | -0.003 |
| 28.233333 | -0.002 |
| 28.25 | -0.003 |
| 28.266667 | 0 |
| 28.283333 | 0.003 |
| 28.3 | 0.001 |
| 28.316667 | -0.016 |
| 28.333333 | -0.036 |
| 28.35 | -0.048 |
| 28.366667 | -0.05 |
| 28.383333 | -0.046 |
| 28.4 | -0.014 |
| 28.416667 | 0.02 |
| 28.433333 | 0.039 |
| 28.45 | 0.042 |
| 28.466667 | 0.032 |
| 28.483333 | 0.026 |
| 28.5 | 0.022 |
| 28.516667 | 0.017 |
| 28.533333 | 0.018 |
| 28.55 | 0.016 |
| 28.566667 | -0.084 |
| 28.583333 | -0.317 |
| 28.6 | -0.654 |
| 28.616667 | -1.043 |
| 28.633333 | -1.346 |
| 28.65 | -1.482 |
| 28.666667 | -1.442 |
| 28.683333 | -1.276 |
| 28.7 | -1.053 |
| 28.716667 | -0.823 |
| 28.733333 | -0.625 |
| 28.75 | -0.458 |
| 28.766667 | -0.326 |
| 28.783333 | -0.227 |
| 28.8 | -0.159 |
| 28.816667 | -0.124 |
| 28.833333 | -0.104 |
| 28.85 | -0.095 |
| 28.866667 | -0.085 |
| 28.883333 | -0.083 |
| 28.9 | -0.077 |
| 28.916667 | -0.074 |
| 28.933333 | -0.073 |
| 28.95 | -0.065 |
| 28.966667 | -0.055 |
| 28.983333 | -0.044 |
| 29.0 | -0.039 |
| 29.016667 | -0.037 |
| 29.033333 | -0.035 |
| 29.05 | -0.031 |
| 29.066667 | -0.029 |
| 29.083333 | -0.027 |
| 29.1 | -0.025 |
| 29.116667 | -0.024 |
| 29.133333 | -0.023 |
| 29.15 | -0.021 |
| 29.166667 | -0.019 |
| 29.183333 | -0.018 |
| 29.2 | -0.016 |
| 29.216667 | -0.014 |
| 29.233333 | -0.013 |
| 29.25 | -0.012 |
| 29.266667 | -0.01 |
| 29.283333 | -0.007 |
| 29.3 | -0.006 |
| 29.316667 | -0.004 |
| 29.333333 | 0.001 |
| 29.35 | 0.007 |
| 29.366667 | 0.008 |
| 29.383333 | 0.021 |
| 29.4 | 0.027 |
| 29.416667 | 0.022 |
| 29.433333 | 0.011 |
| 29.45 | -0.003 |
| 29.466667 | -0.005 |
| 29.483333 | -0.006 |
| 29.5 | -0.009 |
| 29.516667 | -0.01 |
| 29.533333 | -0.01 |
| 29.55 | -0.009 |
| 29.566667 | -0.01 |
| 29.583333 | -0.01 |
| 29.6 | -0.009 |
| 29.616667 | -0.006 |
| 29.633333 | -0.003 |
| 29.65 | 0.002 |
| 29.666667 | 0.006 |
| 29.683333 | 0.044 |
| 29.7 | 0.046 |
| 29.716667 | 0.025 |
| 29.733333 | 0.024 |
| 29.75 | 0.013 |
| 29.766667 | 0.005 |
| 29.783333 | -0.005 |
| 29.8 | -0.01 |
| 29.816667 | -0.011 |
| 29.833333 | -0.01 |
| 29.85 | -0.01 |
| 29.866667 | -0.01 |
| 29.883333 | -0.01 |
| 29.9 | -0.01 |
| 29.916667 | -0.009 |
| 29.933333 | -0.008 |
| 29.95 | -0.007 |
| 29.966667 | -0.006 |
| 29.983333 | -0.004 |
| 30.0 | -0.004 |
| 30.016667 | -0.003 |
| 30.033333 | -0.002 |
| 30.05 | -0.001 |
| 30.066667 | 0 |
| 30.083333 | 0.001 |
| 30.1 | 0.001 |
| 30.116667 | 0.003 |
| 30.133333 | 0.004 |
| 30.15 | 0.005 |
| 30.166667 | 0.003 |
| 30.183333 | 0.002 |
| 30.2 | 0.002 |
| 30.216667 | 0.002 |
| 30.233333 | 0.002 |
| 30.25 | 0.003 |
| 30.266667 | 0.003 |
| 30.283333 | 0.003 |
| 30.3 | 0.002 |
| 30.316667 | 0.002 |
| 30.333333 | 0.003 |
| 30.35 | 0.004 |
| 30.366667 | 0.005 |
| 30.383333 | 0.005 |
| 30.4 | 0.007 |
| 30.416667 | 0.007 |
| 30.433333 | 0.007 |
| 30.45 | 0.009 |
| 30.466667 | 0.015 |
| 30.483333 | 0.01 |
| 30.5 | -0.001 |
| 30.516667 | -0.008 |
| 30.533333 | -0.012 |
| 30.55 | -0.01 |
| 30.566667 | -0.011 |
| 30.583333 | -0.011 |
| 30.6 | -0.011 |
| 30.616667 | -0.009 |
| 30.633333 | -0.008 |
| 30.65 | -0.008 |
| 30.666667 | -0.007 |
| 30.683333 | -0.006 |
| 30.7 | -0.005 |
| 30.716667 | -0.004 |
| 30.733333 | -0.003 |
| 30.75 | -0.002 |
| 30.766667 | -0.002 |
| 30.783333 | -0.001 |
| 30.8 | 0 |
| 30.816667 | 0.002 |
| 30.833333 | 0.002 |
| 30.85 | 0.003 |
| 30.866667 | 0.004 |
| 30.883333 | 0.004 |
| 30.9 | 0.005 |
| 30.916667 | 0.005 |
| 30.933333 | 0.006 |
| 30.95 | 0.006 |
| 30.966667 | 0.005 |
| 30.983333 | 0.007 |
| 31.0 | 0.008 |
| 31.016667 | 0.005 |
| 31.033333 | 0.007 |
| 31.05 | -0.005 |
| 31.066667 | -0.117 |
| 31.083333 | -0.352 |
| 31.1 | -0.688 |
| 31.116667 | -1.059 |
| 31.133333 | -1.336 |
| 31.15 | -1.449 |
| 31.166667 | -1.392 |
| 31.183333 | -1.222 |
| 31.2 | -1.009 |
| 31.216667 | -0.791 |
| 31.233333 | -0.601 |
| 31.25 | -0.442 |
| 31.266667 | -0.311 |
| 31.283333 | -0.217 |
| 31.3 | -0.154 |
| 31.316667 | -0.123 |
| 31.333333 | -0.111 |
| 31.35 | -0.101 |
| 31.366667 | -0.094 |
| 31.383333 | -0.085 |
| 31.4 | -0.078 |
| 31.416667 | -0.074 |
| 31.433333 | -0.069 |
| 31.45 | -0.066 |
| 31.466667 | -0.061 |
| 31.483333 | -0.057 |
| 31.5 | -0.052 |
| 31.516667 | -0.047 |
| 31.533333 | -0.042 |
| 31.55 | -0.037 |
| 31.566667 | -0.033 |
| 31.583333 | -0.027 |
| 31.6 | -0.018 |
| 31.616667 | -0.02 |
| 31.633333 | -0.021 |
| 31.65 | -0.021 |
| 31.666667 | -0.021 |
| 31.683333 | -0.02 |
| 31.7 | -0.019 |
| 31.716667 | -0.018 |
| 31.733333 | -0.017 |
| 31.75 | -0.016 |
| 31.766667 | -0.015 |
| 31.783333 | -0.014 |
| 31.8 | -0.013 |
| 31.816667 | -0.011 |
| 31.833333 | -0.01 |
| 31.85 | -0.009 |
| 31.866667 | -0.008 |
| 31.883333 | -0.006 |
| 31.9 | -0.005 |
| 31.916667 | -0.004 |
| 31.933333 | -0.003 |
| 31.95 | -0.003 |
| 31.966667 | -0.002 |
| 31.983333 | -0.001 |
| 32.0 | -0.001 |
| 32.016667 | 0 |
| 32.033333 | 0 |
| 32.05 | 0 |
| 32.066667 | 0 |
| 32.083333 | 0 |
| 32.1 | 0 |
| 32.116667 | 0 |
| 32.133333 | 0 |
| 32.15 | 0 |
| 32.166667 | 0 |
| 32.183333 | 0 |
| 32.2 | 0 |
| 32.216667 | 0 |
| 32.233333 | -0.001 |
| 32.25 | -0.001 |
| 32.266667 | -0.001 |
| 32.283333 | -0.001 |
| 32.3 | 0 |
| 32.316667 | 0 |
| 32.333333 | 0 |
| 32.35 | -0.001 |
| 32.366667 | 0 |
| 32.383333 | 0 |
| 32.4 | 0 |
| 32.416667 | 0 |
| 32.433333 | 0.001 |
| 32.45 | 0.002 |
| 32.466667 | 0.001 |
| 32.483333 | 0.001 |
| 32.5 | 0.002 |
| 32.516667 | 0.003 |
| 32.533333 | 0.005 |
| 32.55 | 0.005 |
| 32.566667 | 0.004 |
| 32.583333 | 0.004 |
| 32.6 | 0.007 |
| 32.616667 | 0.008 |
| 32.633333 | 0.007 |
| 32.65 | 0.009 |
| 32.666667 | 0.01 |
| 32.683333 | 0.01 |
| 32.7 | 0.009 |
| 32.716667 | 0.006 |
| 32.733333 | 0.004 |
| 32.75 | 0.001 |
| 32.766667 | 0 |
| 32.783333 | -0.003 |
| 32.8 | -0.009 |
| 32.816667 | -0.01 |
| 32.833333 | -0.01 |
| 32.85 | -0.01 |
| 32.866667 | -0.009 |
| 32.883333 | -0.008 |
| 32.9 | -0.007 |
| 32.916667 | -0.007 |
| 32.933333 | -0.006 |
| 32.95 | -0.005 |
| 32.966667 | -0.003 |
| 32.983333 | -0.002 |
| 33.0 | -0.001 |
| 33.016667 | 0 |
| 33.033333 | 0.001 |
| 33.05 | 0.002 |
| 33.066667 | 0.002 |
| 33.083333 | 0.002 |
| 33.1 | 0.002 |
| 33.116667 | 0.003 |
| 33.133333 | 0.003 |
| 33.15 | 0.003 |
| 33.166667 | 0.003 |
| 33.183333 | 0.003 |
| 33.2 | 0.003 |
| 33.216667 | 0.003 |
| 33.233333 | 0.003 |
| 33.25 | 0.002 |
| 33.266667 | 0.002 |
| 33.283333 | 0.002 |
| 33.3 | 0.001 |
| 33.316667 | 0.001 |
| 33.333333 | 0 |
| 33.35 | -0.002 |
| 33.366667 | -0.003 |
| 33.383333 | -0.003 |
| 33.4 | -0.003 |
| 33.416667 | -0.004 |
| 33.433333 | -0.005 |
| 33.45 | -0.006 |
| 33.466667 | -0.008 |
| 33.483333 | -0.009 |
| 33.5 | -0.012 |
| 33.516667 | -0.016 |
| 33.533333 | -0.018 |
| 33.55 | -0.018 |
| 33.566667 | -0.101 |
| 33.583333 | -0.313 |
| 33.6 | -0.626 |
| 33.616667 | -0.999 |
| 33.633333 | -1.292 |
| 33.65 | -1.419 |
| 33.666667 | -1.386 |
| 33.683333 | -1.237 |
| 33.7 | -1.031 |
| 33.716667 | -0.812 |
| 33.733333 | -0.614 |
| 33.75 | -0.448 |
| 33.766667 | -0.316 |
| 33.783333 | -0.222 |
| 33.8 | -0.166 |
| 33.816667 | -0.131 |
| 33.833333 | -0.115 |
| 33.85 | -0.103 |
| 33.866667 | -0.096 |
| 33.883333 | -0.086 |
| 33.9 | -0.081 |
| 33.916667 | -0.079 |
| 33.933333 | -0.076 |
| 33.95 | -0.073 |
| 33.966667 | -0.069 |
| 33.983333 | -0.065 |
| 34.0 | -0.06 |
| 34.016667 | -0.057 |
| 34.033333 | -0.052 |
| 34.05 | -0.049 |
| 34.066667 | -0.046 |
| 34.083333 | -0.043 |
| 34.1 | -0.04 |
| 34.116667 | -0.037 |
| 34.133333 | -0.036 |
| 34.15 | -0.033 |
| 34.166667 | -0.033 |
| 34.183333 | -0.026 |
| 34.2 | -0.017 |
| 34.216667 | -0.018 |
| 34.233333 | -0.024 |
| 34.25 | -0.028 |
| 34.266667 | -0.026 |
| 34.283333 | -0.023 |
| 34.3 | -0.022 |
| 34.316667 | -0.02 |
| 34.333333 | -0.019 |
| 34.35 | -0.018 |
| 34.366667 | -0.016 |
| 34.383333 | -0.015 |
| 34.4 | -0.013 |
| 34.416667 | -0.011 |
| 34.433333 | -0.009 |
| 34.45 | -0.008 |
| 34.466667 | -0.007 |
| 34.483333 | -0.005 |
| 34.5 | -0.005 |
| 34.516667 | -0.004 |
| 34.533333 | -0.002 |
| 34.55 | -0.001 |
| 34.566667 | 0.001 |
| 34.583333 | 0.002 |
| 34.6 | 0.003 |
| 34.616667 | 0.004 |
| 34.633333 | 0.005 |
| 34.65 | 0.006 |
| 34.666667 | 0.007 |
| 34.683333 | 0.007 |
| 34.7 | 0.006 |
| 34.716667 | 0.006 |
| 34.733333 | 0.007 |
| 34.75 | 0.006 |
| 34.766667 | 0.004 |
| 34.783333 | 0.002 |
| 34.8 | 0.001 |
| 34.816667 | 0.002 |
| 34.833333 | 0.002 |
| 34.85 | 0.002 |
| 34.866667 | 0.001 |
| 34.883333 | 0 |
| 34.9 | -0.002 |
| 34.916667 | -0.002 |
| 34.933333 | -0.002 |
| 34.95 | -0.002 |
| 34.966667 | -0.003 |
| 34.983333 | -0.005 |
| 35.0 | -0.008 |
| 35.016667 | -0.008 |
| 35.033333 | -0.008 |
| 35.05 | -0.008 |
| 35.066667 | -0.008 |
| 35.083333 | -0.007 |
| 35.1 | -0.007 |
| 35.116667 | -0.008 |
| 35.133333 | -0.008 |
| 35.15 | -0.007 |
| 35.166667 | -0.006 |
| 35.183333 | -0.006 |
| 35.2 | -0.004 |
| 35.216667 | -0.001 |
| 35.233333 | 0.001 |
| 35.25 | 0.002 |
| 35.266667 | 0.004 |
| 35.283333 | 0.005 |
| 35.3 | 0.005 |
| 35.316667 | 0.006 |
| 35.333333 | 0.006 |
| 35.35 | 0.006 |
| 35.366667 | 0.006 |
| 35.383333 | 0.006 |
| 35.4 | 0.007 |
| 35.416667 | 0.007 |
| 35.433333 | 0.007 |
| 35.45 | 0.006 |
| 35.466667 | 0.006 |
| 35.483333 | 0.005 |
| 35.5 | 0.004 |
| 35.516667 | 0.004 |
| 35.533333 | 0.003 |
| 35.55 | 0.003 |
| 35.566667 | 0.002 |
| 35.583333 | 0.002 |
| 35.6 | 0.001 |
| 35.616667 | 0 |
| 35.633333 | 0.001 |
| 35.65 | 0 |
| 35.666667 | -0.001 |
| 35.683333 | -0.002 |
| 35.7 | -0.001 |
| 35.716667 | 0.001 |
| 35.733333 | 0.002 |
| 35.75 | 0.002 |
| 35.766667 | -0.007 |
| 35.783333 | -0.011 |
| 35.8 | -0.012 |
| 35.816667 | -0.01 |
| 35.833333 | -0.009 |
| 35.85 | -0.008 |
| 35.866667 | -0.007 |
| 35.883333 | -0.006 |
| 35.9 | -0.005 |
| 35.916667 | -0.003 |
| 35.933333 | -0.003 |
| 35.95 | -0.001 |
| 35.966667 | -0.001 |
| 35.983333 | 0.001 |
| 36.0 | 0.009 |
| 36.016667 | 0.016 |
| 36.033333 | 0.018 |
| 36.05 | 0.012 |
| 36.066667 | -0.069 |
| 36.083333 | -0.277 |
| 36.1 | -0.585 |
| 36.116667 | -0.947 |
| 36.133333 | -1.24 |
| 36.15 | -1.384 |
| 36.166667 | -1.365 |
| 36.183333 | -1.229 |
| 36.2 | -1.029 |
| 36.216667 | -0.818 |
| 36.233333 | -0.627 |
| 36.25 | -0.463 |
| 36.266667 | -0.329 |
| 36.283333 | -0.234 |
| 36.3 | -0.172 |
| 36.316667 | -0.14 |
| 36.333333 | -0.12 |
| 36.35 | -0.116 |
| 36.366667 | -0.108 |
| 36.383333 | -0.1 |
| 36.4 | -0.097 |
| 36.416667 | -0.1 |
| 36.433333 | -0.092 |
| 36.45 | -0.086 |
| 36.466667 | -0.085 |
| 36.483333 | -0.079 |
| 36.5 | -0.072 |
| 36.516667 | -0.067 |
| 36.533333 | -0.062 |
| 36.55 | -0.056 |
| 36.566667 | -0.054 |
| 36.583333 | -0.053 |
| 36.6 | -0.052 |
| 36.616667 | -0.05 |
| 36.633333 | -0.048 |
| 36.65 | -0.047 |
| 36.666667 | -0.045 |
| 36.683333 | -0.044 |
| 36.7 | -0.043 |
| 36.716667 | -0.04 |
| 36.733333 | -0.038 |
| 36.75 | -0.036 |
| 36.766667 | -0.033 |
| 36.783333 | -0.031 |
| 36.8 | -0.028 |
| 36.816667 | -0.025 |
| 36.833333 | -0.023 |
| 36.85 | -0.02 |
| 36.866667 | -0.018 |
| 36.883333 | -0.015 |
| 36.9 | -0.012 |
| 36.916667 | -0.011 |
| 36.933333 | -0.009 |
| 36.95 | -0.008 |
| 36.966667 | -0.006 |
| 36.983333 | -0.004 |
| 37.0 | -0.003 |
| 37.016667 | -0.001 |
| 37.033333 | 0.001 |
| 37.05 | 0.002 |
| 37.066667 | 0.003 |
| 37.083333 | 0.004 |
| 37.1 | 0.005 |
| 37.116667 | 0.006 |
| 37.133333 | 0.006 |
| 37.15 | 0.006 |
| 37.166667 | 0.007 |
| 37.183333 | 0.008 |
| 37.2 | 0.008 |
| 37.216667 | 0.008 |
| 37.233333 | 0.009 |
| 37.25 | 0.009 |
| 37.266667 | 0.01 |
| 37.283333 | 0.009 |
| 37.3 | 0.008 |
| 37.316667 | 0.008 |
| 37.333333 | 0.008 |
| 37.35 | 0.007 |
| 37.366667 | 0.007 |
| 37.383333 | 0.007 |
| 37.4 | 0.006 |
| 37.416667 | 0.006 |
| 37.433333 | 0.006 |
| 37.45 | 0.005 |
| 37.466667 | 0.005 |
| 37.483333 | 0.003 |
| 37.5 | 0.002 |
| 37.516667 | 0.002 |
| 37.533333 | 0.001 |
| 37.55 | 0 |
| 37.566667 | -0.001 |
| 37.583333 | -0.001 |
| 37.6 | -0.002 |
| 37.616667 | -0.003 |
| 37.633333 | -0.003 |
| 37.65 | -0.004 |
| 37.666667 | -0.005 |
| 37.683333 | -0.006 |
| 37.7 | -0.006 |
| 37.716667 | -0.007 |
| 37.733333 | -0.007 |
| 37.75 | -0.006 |
| 37.766667 | -0.005 |
| 37.783333 | 0.009 |
| 37.8 | 0.016 |
| 37.816667 | 0.014 |
| 37.833333 | 0.008 |
| 37.85 | -0.002 |
| 37.866667 | -0.005 |
| 37.883333 | -0.006 |
| 37.9 | -0.003 |
| 37.916667 | -0.001 |
| 37.933333 | 0.002 |
| 37.95 | 0.005 |
| 37.966667 | 0.006 |
| 37.983333 | 0.009 |
| 38.0 | 0.012 |
| 38.016667 | 0.012 |
| 38.033333 | 0.012 |
| 38.05 | 0.005 |
| 38.066667 | -0.003 |
| 38.083333 | -0.004 |
| 38.1 | -0.005 |
| 38.116667 | -0.004 |
| 38.133333 | -0.004 |
| 38.15 | -0.004 |
| 38.166667 | -0.004 |
| 38.183333 | -0.005 |
| 38.2 | -0.005 |
| 38.216667 | -0.005 |
| 38.233333 | -0.005 |
| 38.25 | -0.005 |
| 38.266667 | -0.005 |
| 38.283333 | -0.005 |
| 38.3 | -0.005 |
| 38.316667 | -0.005 |
| 38.333333 | -0.005 |
| 38.35 | -0.005 |
| 38.366667 | -0.005 |
| 38.383333 | -0.005 |
| 38.4 | -0.005 |
| 38.416667 | -0.004 |
| 38.433333 | -0.004 |
| 38.45 | -0.004 |
| 38.466667 | -0.004 |
| 38.483333 | -0.003 |
| 38.5 | -0.002 |
| 38.516667 | -0.001 |
| 38.533333 | -0.001 |
| 38.55 | -0.002 |
| 38.566667 | -0.064 |
| 38.583333 | -0.245 |
| 38.6 | -0.532 |
| 38.616667 | -0.878 |
| 38.633333 | -1.183 |
| 38.65 | -1.342 |
| 38.666667 | -1.348 |
| 38.683333 | -1.222 |
| 38.7 | -1.027 |
| 38.716667 | -0.818 |
| 38.733333 | -0.626 |
| 38.75 | -0.463 |
| 38.766667 | -0.334 |
| 38.783333 | -0.234 |
| 38.8 | -0.164 |
| 38.816667 | -0.118 |
| 38.833333 | -0.098 |
| 38.85 | -0.085 |
| 38.866667 | -0.072 |
| 38.883333 | -0.069 |
| 38.9 | -0.064 |
| 38.916667 | -0.059 |
| 38.933333 | -0.055 |
| 38.95 | -0.052 |
| 38.966667 | -0.048 |
| 38.983333 | -0.044 |
| 39.0 | -0.04 |
| 39.016667 | -0.037 |
| 39.033333 | -0.033 |
| 39.05 | -0.03 |
| 39.066667 | -0.026 |
| 39.083333 | -0.023 |
| 39.1 | -0.022 |
| 39.116667 | -0.019 |
| 39.133333 | -0.017 |
| 39.15 | -0.016 |
| 39.166667 | -0.015 |
| 39.183333 | -0.014 |
| 39.2 | -0.013 |
| 39.216667 | -0.011 |
| 39.233333 | -0.01 |
| 39.25 | -0.009 |
| 39.266667 | -0.008 |
| 39.283333 | -0.008 |
| 39.3 | -0.007 |
| 39.316667 | -0.007 |
| 39.333333 | -0.006 |
| 39.35 | -0.005 |
| 39.366667 | -0.004 |
| 39.383333 | -0.003 |
| 39.4 | -0.003 |
| 39.416667 | -0.002 |
| 39.433333 | -0.002 |
| 39.45 | -0.001 |
| 39.466667 | -0.001 |
| 39.483333 | -0.001 |
| 39.5 | 0 |
| 39.516667 | 0 |
| 39.533333 | 0 |
| 39.55 | 0 |
| 39.566667 | 0 |
| 39.583333 | 0.001 |
| 39.6 | 0.001 |
| 39.616667 | 0.002 |
| 39.633333 | 0.002 |
| 39.65 | 0.002 |
| 39.666667 | 0.003 |
| 39.683333 | 0.003 |
| 39.7 | 0.003 |
| 39.716667 | 0.004 |
| 39.733333 | 0.004 |
| 39.75 | 0.004 |
| 39.766667 | 0.005 |
| 39.783333 | 0.005 |
| 39.8 | 0.005 |
| 39.816667 | 0.005 |
| 39.833333 | 0.005 |
| 39.85 | 0.006 |
| 39.866667 | 0.005 |
| 39.883333 | 0.004 |
| 39.9 | 0.004 |
| 39.916667 | 0.003 |
| 39.933333 | 0.002 |
| 39.95 | 0.001 |
| 39.966667 | 0 |
| 39.983333 | -0.001 |
| 40.0 | -0.002 |
| 40.016667 | -0.002 |
| 40.033333 | -0.003 |
| 40.05 | -0.004 |
| 40.066667 | -0.005 |
| 40.083333 | -0.005 |
| 40.1 | -0.005 |
| 40.116667 | -0.005 |
| 40.133333 | -0.006 |
| 40.15 | -0.006 |
| 40.166667 | -0.006 |
| 40.183333 | -0.006 |
| 40.2 | -0.006 |
| 40.216667 | -0.006 |
| 40.233333 | -0.005 |
| 40.25 | -0.004 |
| 40.266667 | -0.004 |
| 40.283333 | -0.003 |
| 40.3 | -0.003 |
| 40.316667 | -0.002 |
| 40.333333 | -0.002 |
| 40.35 | -0.001 |
| 40.366667 | -0.001 |
| 40.383333 | -0.001 |
| 40.4 | 0 |
| 40.416667 | 0 |
| 40.433333 | 0.001 |
| 40.45 | 0.001 |
| 40.466667 | 0.002 |
| 40.483333 | 0.002 |
| 40.5 | 0.002 |
| 40.516667 | 0.002 |
| 40.533333 | 0.002 |
| 40.55 | 0.002 |
| 40.566667 | 0.002 |
| 40.583333 | 0.002 |
| 40.6 | 0.002 |
| 40.616667 | 0.003 |
| 40.633333 | 0.003 |
| 40.65 | 0.004 |
| 40.666667 | 0.004 |
| 40.683333 | 0.005 |
| 40.7 | 0.005 |
| 40.716667 | 0.005 |
| 40.733333 | 0.005 |
| 40.75 | 0.005 |
| 40.766667 | 0.005 |
| 40.783333 | 0.005 |
| 40.8 | 0.005 |
| 40.816667 | 0.004 |
| 40.833333 | 0.004 |
| 40.85 | 0.003 |
| 40.866667 | 0.002 |
| 40.883333 | 0 |
| 40.9 | -0.001 |
| 40.916667 | -0.003 |
| 40.933333 | -0.004 |
| 40.95 | -0.005 |
| 40.966667 | -0.007 |
| 40.983333 | -0.009 |
| 41.0 | -0.011 |
| 41.016667 | -0.012 |
| 41.033333 | -0.011 |
| 41.05 | -0.011 |
| 41.066667 | -0.058 |
| 41.083333 | -0.223 |
| 41.1 | -0.493 |
| 41.116667 | -0.841 |
| 41.133333 | -1.158 |
| 41.15 | -1.337 |
| 41.166667 | -1.359 |
| 41.183333 | -1.247 |
| 41.2 | -1.062 |
| 41.216667 | -0.857 |
| 41.233333 | -0.668 |
| 41.25 | -0.507 |
| 41.266667 | -0.371 |
| 41.283333 | -0.266 |
| 41.3 | -0.192 |
| 41.316667 | -0.15 |
| 41.333333 | -0.123 |
| 41.35 | -0.108 |
| 41.366667 | -0.099 |
| 41.383333 | -0.089 |
| 41.4 | -0.079 |
| 41.416667 | -0.071 |
| 41.433333 | -0.065 |
| 41.45 | -0.06 |
| 41.466667 | -0.054 |
| 41.483333 | -0.049 |
| 41.5 | -0.044 |
| 41.516667 | -0.037 |
| 41.533333 | -0.03 |
| 41.55 | -0.026 |
| 41.566667 | -0.021 |
| 41.583333 | -0.017 |
| 41.6 | -0.013 |
| 41.616667 | -0.012 |
| 41.633333 | -0.011 |
| 41.65 | -0.011 |
| 41.666667 | -0.01 |
| 41.683333 | -0.01 |
| 41.7 | -0.009 |
| 41.716667 | -0.008 |
| 41.733333 | -0.008 |
| 41.75 | -0.007 |
| 41.766667 | -0.006 |
| 41.783333 | -0.006 |
| 41.8 | -0.006 |
| 41.816667 | -0.006 |
| 41.833333 | -0.006 |
| 41.85 | -0.005 |
| 41.866667 | -0.005 |
| 41.883333 | -0.004 |
| 41.9 | -0.004 |
| 41.916667 | -0.004 |
| 41.933333 | -0.004 |
| 41.95 | -0.004 |
| 41.966667 | -0.003 |
| 41.983333 | -0.003 |
| 42.0 | -0.003 |
| 42.016667 | -0.002 |
| 42.033333 | -0.002 |
| 42.05 | -0.002 |
| 42.066667 | -0.002 |
| 42.083333 | -0.001 |
| 42.1 | -0.001 |
| 42.116667 | -0.001 |
| 42.133333 | -0.001 |
| 42.15 | 0 |
| 42.166667 | 0 |
| 42.183333 | 0.001 |
| 42.2 | 0.001 |
| 42.216667 | 0.001 |
| 42.233333 | 0.002 |
| 42.25 | 0.002 |
| 42.266667 | 0.002 |
| 42.283333 | 0.003 |
| 42.3 | 0.003 |
| 42.316667 | 0.003 |
| 42.333333 | 0.004 |
| 42.35 | 0.004 |
| 42.366667 | 0.004 |
| 42.383333 | 0.004 |
| 42.4 | 0.004 |
| 42.416667 | 0.004 |
| 42.433333 | 0.003 |
| 42.45 | 0.003 |
| 42.466667 | 0.003 |
| 42.483333 | 0.002 |
| 42.5 | 0.002 |
| 42.516667 | 0.001 |
| 42.533333 | 0 |
| 42.55 | 0 |
| 42.566667 | 0 |
| 42.583333 | -0.001 |
| 42.6 | -0.001 |
| 42.616667 | -0.002 |
| 42.633333 | -0.002 |
| 42.65 | -0.003 |
| 42.666667 | -0.004 |
| 42.683333 | -0.004 |
| 42.7 | -0.004 |
| 42.716667 | -0.004 |
| 42.733333 | -0.004 |
| 42.75 | -0.004 |
| 42.766667 | -0.004 |
| 42.783333 | -0.004 |
| 42.8 | -0.004 |
| 42.816667 | -0.003 |
| 42.833333 | -0.003 |
| 42.85 | -0.002 |
| 42.866667 | -0.002 |
| 42.883333 | -0.002 |
| 42.9 | -0.002 |
| 42.916667 | -0.002 |
| 42.933333 | -0.001 |
| 42.95 | -0.001 |
| 42.966667 | 0 |
| 42.983333 | 0 |
| 43.0 | 0 |
| 43.016667 | 0 |
| 43.033333 | 0.001 |
| 43.05 | 0.001 |
| 43.066667 | 0.002 |
| 43.083333 | 0.002 |
| 43.1 | 0.002 |
| 43.116667 | 0.003 |
| 43.133333 | 0.003 |
| 43.15 | 0.003 |
| 43.166667 | 0.003 |
| 43.183333 | 0.003 |
| 43.2 | 0.003 |
| 43.216667 | 0.003 |
| 43.233333 | 0.003 |
| 43.25 | 0.004 |
| 43.266667 | 0.004 |
| 43.283333 | 0.004 |
| 43.3 | 0.004 |
| 43.316667 | 0.004 |
| 43.333333 | 0.003 |
| 43.35 | 0.003 |
| 43.366667 | 0.003 |
| 43.383333 | 0.002 |
| 43.4 | 0.002 |
| 43.416667 | 0.002 |
| 43.433333 | 0.002 |
| 43.45 | 0.001 |
| 43.466667 | 0 |
| 43.483333 | -0.001 |
| 43.5 | -0.002 |
| 43.516667 | -0.003 |
| 43.533333 | 0 |
| 43.55 | -0.004 |
| 43.566667 | -0.046 |
| 43.583333 | -0.207 |
| 43.6 | -0.469 |
| 43.616667 | -0.809 |
| 43.633333 | -1.125 |
| 43.65 | -1.31 |
| 43.666667 | -1.342 |
| 43.683333 | -1.241 |
| 43.7 | -1.066 |
| 43.716667 | -0.863 |
| 43.733333 | -0.671 |
| 43.75 | -0.509 |
| 43.766667 | -0.374 |
| 43.783333 | -0.27 |
| 43.8 | -0.197 |
| 43.816667 | -0.15 |
| 43.833333 | -0.122 |
| 43.85 | -0.114 |
| 43.866667 | -0.107 |
| 43.883333 | -0.089 |
| 43.9 | -0.076 |
| 43.916667 | -0.073 |
| 43.933333 | -0.067 |
| 43.95 | -0.063 |
| 43.966667 | -0.058 |
| 43.983333 | -0.053 |
| 44.0 | -0.049 |
| 44.016667 | -0.045 |
| 44.033333 | -0.04 |
| 44.05 | -0.036 |
| 44.066667 | -0.03 |
| 44.083333 | -0.023 |
| 44.1 | -0.021 |
| 44.116667 | -0.019 |
| 44.133333 | -0.016 |
| 44.15 | -0.015 |
| 44.166667 | -0.014 |
| 44.183333 | -0.013 |
| 44.2 | -0.012 |
| 44.216667 | -0.01 |
| 44.233333 | -0.009 |
| 44.25 | -0.008 |
| 44.266667 | -0.008 |
| 44.283333 | -0.007 |
| 44.3 | -0.006 |
| 44.316667 | -0.005 |
| 44.333333 | -0.005 |
| 44.35 | -0.005 |
| 44.366667 | -0.005 |
| 44.383333 | -0.005 |
| 44.4 | -0.004 |
| 44.416667 | -0.004 |
| 44.433333 | -0.004 |
| 44.45 | -0.003 |
| 44.466667 | -0.004 |
| 44.483333 | -0.003 |
| 44.5 | -0.003 |
| 44.516667 | -0.004 |
| 44.533333 | -0.004 |
| 44.55 | -0.004 |
| 44.566667 | -0.004 |
| 44.583333 | -0.004 |
| 44.6 | -0.004 |
| 44.616667 | -0.004 |
| 44.633333 | -0.004 |
| 44.65 | -0.003 |
| 44.666667 | -0.003 |
| 44.683333 | -0.002 |
| 44.7 | -0.002 |
| 44.716667 | -0.002 |
| 44.733333 | -0.002 |
| 44.75 | -0.002 |
| 44.766667 | -0.002 |
| 44.783333 | -0.001 |
| 44.8 | -0.001 |
| 44.816667 | 0 |
| 44.833333 | 0 |
| 44.85 | 0 |
| 44.866667 | 0.001 |
| 44.883333 | 0.001 |
| 44.9 | 0.001 |
| 44.916667 | 0.001 |
| 44.933333 | 0.002 |
| 44.95 | 0.002 |
| 44.966667 | 0.002 |
| 44.983333 | 0.002 |
| 45.0 | 0.002 |
| 45.016667 | 0.002 |
| 45.033333 | 0.003 |
| 45.05 | 0.003 |
| 45.066667 | 0.003 |
| 45.083333 | 0.003 |
| 45.1 | 0.004 |
| 45.116667 | 0.004 |
| 45.133333 | 0.004 |
| 45.15 | 0.004 |
| 45.166667 | 0.004 |
| 45.183333 | 0.004 |
| 45.2 | 0.004 |
| 45.216667 | 0.004 |
| 45.233333 | 0.004 |
| 45.25 | 0.004 |
| 45.266667 | 0.004 |
| 45.283333 | 0.004 |
| 45.3 | 0.003 |
| 45.316667 | 0.003 |
| 45.333333 | 0.003 |
| 45.35 | 0.002 |
| 45.366667 | 0.002 |
| 45.383333 | 0.002 |
| 45.4 | 0.001 |
| 45.416667 | 0.001 |
| 45.433333 | 0.001 |
| 45.45 | 0 |
| 45.466667 | 0 |
| 45.483333 | 0 |
| 45.5 | -0.001 |
| 45.516667 | -0.001 |
| 45.533333 | -0.002 |
| 45.55 | -0.002 |
| 45.566667 | -0.002 |
| 45.583333 | -0.002 |
| 45.6 | -0.003 |
| 45.616667 | -0.003 |
| 45.633333 | -0.003 |
| 45.65 | -0.003 |
| 45.666667 | -0.003 |
| 45.683333 | -0.003 |
| 45.7 | -0.003 |
| 45.716667 | -0.003 |
| 45.733333 | -0.002 |
| 45.75 | -0.002 |
| 45.766667 | -0.002 |
| 45.783333 | -0.002 |
| 45.8 | -0.002 |
| 45.816667 | -0.002 |
| 45.833333 | -0.001 |
| 45.85 | -0.001 |
| 45.866667 | 0 |
| 45.883333 | 0 |
| 45.9 | 0.001 |
| 45.916667 | 0.002 |
| 45.933333 | 0.002 |
| 45.95 | 0.003 |
| 45.966667 | 0.003 |
| 45.983333 | 0.003 |
| 46.0 | 0.004 |
| 46.016667 | 0.003 |
| 46.033333 | 0.002 |
| 46.05 | 0.004 |
| 46.066667 | -0.019 |
| 46.083333 | -0.15 |
| 46.1 | -0.392 |
| 46.116667 | -0.721 |
| 46.133333 | -1.049 |
| 46.15 | -1.256 |
| 46.166667 | -1.314 |
| 46.183333 | -1.235 |
| 46.2 | -1.07 |
| 46.216667 | -0.873 |
| 46.233333 | -0.683 |
| 46.25 | -0.518 |
| 46.266667 | -0.381 |
| 46.283333 | -0.272 |
| 46.3 | -0.193 |
| 46.316667 | -0.142 |
| 46.333333 | -0.114 |
| 46.35 | -0.102 |
| 46.366667 | -0.094 |
| 46.383333 | -0.085 |
| 46.4 | -0.077 |
| 46.416667 | -0.069 |
| 46.433333 | -0.062 |
| 46.45 | -0.057 |
| 46.466667 | -0.053 |
| 46.483333 | -0.05 |
| 46.5 | -0.045 |
| 46.516667 | -0.041 |
| 46.533333 | -0.037 |
| 46.55 | -0.034 |
| 46.566667 | -0.031 |
| 46.583333 | -0.03 |
| 46.6 | -0.03 |
| 46.616667 | -0.029 |
| 46.633333 | -0.027 |
| 46.65 | -0.025 |
| 46.666667 | -0.023 |
| 46.683333 | -0.022 |
| 46.7 | -0.021 |
| 46.716667 | -0.02 |
| 46.733333 | -0.019 |
| 46.75 | -0.018 |
| 46.766667 | -0.017 |
| 46.783333 | -0.017 |
| 46.8 | -0.016 |
| 46.816667 | -0.015 |
| 46.833333 | -0.014 |
| 46.85 | -0.012 |
| 46.866667 | -0.011 |
| 46.883333 | -0.009 |
| 46.9 | -0.008 |
| 46.916667 | -0.007 |
| 46.933333 | -0.006 |
| 46.95 | -0.005 |
| 46.966667 | -0.004 |
| 46.983333 | -0.003 |
| 47.0 | -0.002 |
| 47.016667 | -0.001 |
| 47.033333 | -0.001 |
| 47.05 | 0 |
| 47.066667 | 0.001 |
| 47.083333 | 0.001 |
| 47.1 | 0.002 |
| 47.116667 | 0.002 |
| 47.133333 | 0.003 |
| 47.15 | 0.003 |
| 47.166667 | 0.003 |
| 47.183333 | 0.003 |
| 47.2 | 0.003 |
| 47.216667 | 0.003 |
| 47.233333 | 0.003 |
| 47.25 | 0.002 |
| 47.266667 | 0.002 |
| 47.283333 | 0.002 |
| 47.3 | 0.002 |
| 47.316667 | 0.002 |
| 47.333333 | 0.001 |
| 47.35 | 0.001 |
| 47.366667 | 0 |
| 47.383333 | 0 |
| 47.4 | 0 |
| 47.416667 | -0.001 |
| 47.433333 | -0.001 |
| 47.45 | -0.001 |
| 47.466667 | -0.002 |
| 47.483333 | -0.002 |
| 47.5 | -0.002 |
| 47.516667 | -0.002 |
| 47.533333 | -0.002 |
| 47.55 | -0.003 |
| 47.566667 | -0.003 |
| 47.583333 | -0.003 |
| 47.6 | -0.004 |
| 47.616667 | -0.004 |
| 47.633333 | -0.004 |
| 47.65 | -0.004 |
| 47.666667 | -0.004 |
| 47.683333 | -0.004 |
| 47.7 | -0.004 |
| 47.716667 | -0.004 |
| 47.733333 | -0.003 |
| 47.75 | -0.003 |
| 47.766667 | -0.002 |
| 47.783333 | -0.001 |
| 47.8 | -0.001 |
| 47.816667 | 0 |
| 47.833333 | 0 |
| 47.85 | 0 |
| 47.866667 | 0.001 |
| 47.883333 | 0.001 |
| 47.9 | 0.002 |
| 47.916667 | 0.003 |
| 47.933333 | 0.004 |
| 47.95 | 0.004 |
| 47.966667 | 0.005 |
| 47.983333 | 0.005 |
| 48.0 | 0.006 |
| 48.016667 | 0.007 |
| 48.033333 | 0.007 |
| 48.05 | 0.007 |
| 48.066667 | 0.007 |
| 48.083333 | 0.007 |
| 48.1 | 0.007 |
| 48.116667 | 0.007 |
| 48.133333 | 0.007 |
| 48.15 | 0.007 |
| 48.166667 | 0.006 |
| 48.183333 | 0.006 |
| 48.2 | 0.005 |
| 48.216667 | 0.005 |
| 48.233333 | 0.004 |
| 48.25 | 0.003 |
| 48.266667 | 0.002 |
| 48.283333 | 0.001 |
| 48.3 | -0.001 |
| 48.316667 | -0.002 |
| 48.333333 | -0.003 |
| 48.35 | -0.004 |
| 48.366667 | -0.006 |
| 48.383333 | -0.006 |
| 48.4 | -0.006 |
| 48.416667 | -0.006 |
| 48.433333 | -0.007 |
| 48.45 | -0.007 |
| 48.466667 | -0.006 |
| 48.483333 | -0.006 |
| 48.5 | -0.005 |
| 48.516667 | -0.005 |
| 48.533333 | -0.004 |